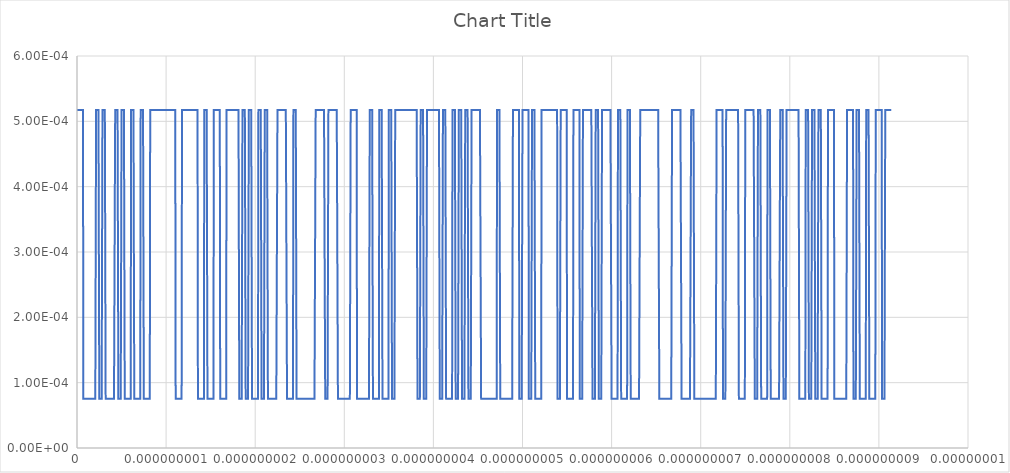
| Category | Series 0 |
|---|---|
| 0.0 | 0.001 |
| 2.23214285714285e-12 | 0.001 |
| 4.46428571428571e-12 | 0.001 |
| 6.69642857142857e-12 | 0.001 |
| 8.92857142857142e-12 | 0.001 |
| 1.11607142857142e-11 | 0.001 |
| 1.33928571428571e-11 | 0.001 |
| 1.5625e-11 | 0.001 |
| 1.78571428571428e-11 | 0.001 |
| 2.00892857142857e-11 | 0.001 |
| 2.23214285714285e-11 | 0.001 |
| 2.45535714285714e-11 | 0.001 |
| 2.67857142857142e-11 | 0.001 |
| 2.90178571428571e-11 | 0.001 |
| 3.125e-11 | 0.001 |
| 3.34821428571428e-11 | 0.001 |
| 3.57142857142857e-11 | 0.001 |
| 3.79464285714285e-11 | 0.001 |
| 4.01785714285714e-11 | 0.001 |
| 4.24107142857142e-11 | 0.001 |
| 4.46428571428571e-11 | 0.001 |
| 4.6875e-11 | 0.001 |
| 4.91071428571428e-11 | 0.001 |
| 5.13392857142857e-11 | 0.001 |
| 5.35714285714285e-11 | 0.001 |
| 5.58035714285714e-11 | 0.001 |
| 5.80357142857142e-11 | 0.001 |
| 6.02678571428571e-11 | 0.001 |
| 6.25e-11 | 0.001 |
| 6.47321428571428e-11 | 0.001 |
| 6.69642857142857e-11 | 0.001 |
| 6.91964285714285e-11 | 0.001 |
| 7.14285714285714e-11 | 0 |
| 7.36607142857142e-11 | 0 |
| 7.58928571428571e-11 | 0 |
| 7.8125e-11 | 0 |
| 8.03571428571428e-11 | 0 |
| 8.25892857142857e-11 | 0 |
| 8.48214285714285e-11 | 0 |
| 8.70535714285714e-11 | 0 |
| 8.92857142857142e-11 | 0 |
| 9.15178571428571e-11 | 0 |
| 9.37499999999999e-11 | 0 |
| 9.59821428571428e-11 | 0 |
| 9.82142857142857e-11 | 0 |
| 1.00446428571428e-10 | 0 |
| 1.02678571428571e-10 | 0 |
| 1.04910714285714e-10 | 0 |
| 1.07142857142857e-10 | 0 |
| 1.09375e-10 | 0 |
| 1.11607142857142e-10 | 0 |
| 1.13839285714285e-10 | 0 |
| 1.16071428571428e-10 | 0 |
| 1.18303571428571e-10 | 0 |
| 1.20535714285714e-10 | 0 |
| 1.22767857142857e-10 | 0 |
| 1.25e-10 | 0 |
| 1.27232142857142e-10 | 0 |
| 1.29464285714285e-10 | 0 |
| 1.31696428571428e-10 | 0 |
| 1.33928571428571e-10 | 0 |
| 1.36160714285714e-10 | 0 |
| 1.38392857142857e-10 | 0 |
| 1.40624999999999e-10 | 0 |
| 1.42857142857142e-10 | 0 |
| 1.45089285714285e-10 | 0 |
| 1.47321428571428e-10 | 0 |
| 1.49553571428571e-10 | 0 |
| 1.51785714285714e-10 | 0 |
| 1.54017857142857e-10 | 0 |
| 1.5625e-10 | 0 |
| 1.58482142857142e-10 | 0 |
| 1.60714285714285e-10 | 0 |
| 1.62946428571428e-10 | 0 |
| 1.65178571428571e-10 | 0 |
| 1.67410714285714e-10 | 0 |
| 1.69642857142857e-10 | 0 |
| 1.71874999999999e-10 | 0 |
| 1.74107142857142e-10 | 0 |
| 1.76339285714285e-10 | 0 |
| 1.78571428571428e-10 | 0 |
| 1.80803571428571e-10 | 0 |
| 1.83035714285714e-10 | 0 |
| 1.85267857142857e-10 | 0 |
| 1.875e-10 | 0 |
| 1.89732142857142e-10 | 0 |
| 1.91964285714285e-10 | 0 |
| 1.94196428571428e-10 | 0 |
| 1.96428571428571e-10 | 0 |
| 1.98660714285714e-10 | 0 |
| 2.00892857142857e-10 | 0 |
| 2.03125e-10 | 0 |
| 2.05357142857142e-10 | 0 |
| 2.07589285714285e-10 | 0 |
| 2.09821428571428e-10 | 0 |
| 2.12053571428571e-10 | 0 |
| 2.14285714285714e-10 | 0.001 |
| 2.16517857142857e-10 | 0.001 |
| 2.18749999999999e-10 | 0.001 |
| 2.20982142857142e-10 | 0.001 |
| 2.23214285714285e-10 | 0.001 |
| 2.25446428571428e-10 | 0.001 |
| 2.27678571428571e-10 | 0.001 |
| 2.29910714285714e-10 | 0.001 |
| 2.32142857142857e-10 | 0.001 |
| 2.34374999999999e-10 | 0.001 |
| 2.36607142857142e-10 | 0.001 |
| 2.38839285714285e-10 | 0.001 |
| 2.41071428571428e-10 | 0.001 |
| 2.43303571428571e-10 | 0.001 |
| 2.45535714285714e-10 | 0.001 |
| 2.47767857142857e-10 | 0.001 |
| 2.5e-10 | 0 |
| 2.52232142857142e-10 | 0 |
| 2.54464285714285e-10 | 0 |
| 2.56696428571428e-10 | 0 |
| 2.58928571428571e-10 | 0 |
| 2.61160714285714e-10 | 0 |
| 2.63392857142857e-10 | 0 |
| 2.65625e-10 | 0 |
| 2.67857142857142e-10 | 0 |
| 2.70089285714285e-10 | 0 |
| 2.72321428571428e-10 | 0 |
| 2.74553571428571e-10 | 0 |
| 2.76785714285714e-10 | 0 |
| 2.79017857142857e-10 | 0 |
| 2.81249999999999e-10 | 0 |
| 2.83482142857142e-10 | 0 |
| 2.85714285714285e-10 | 0.001 |
| 2.87946428571428e-10 | 0.001 |
| 2.90178571428571e-10 | 0.001 |
| 2.92410714285714e-10 | 0.001 |
| 2.94642857142857e-10 | 0.001 |
| 2.96874999999999e-10 | 0.001 |
| 2.99107142857142e-10 | 0.001 |
| 3.01339285714285e-10 | 0.001 |
| 3.03571428571428e-10 | 0.001 |
| 3.05803571428571e-10 | 0.001 |
| 3.08035714285714e-10 | 0.001 |
| 3.10267857142857e-10 | 0.001 |
| 3.125e-10 | 0.001 |
| 3.14732142857142e-10 | 0.001 |
| 3.16964285714285e-10 | 0.001 |
| 3.19196428571428e-10 | 0.001 |
| 3.21428571428571e-10 | 0 |
| 3.23660714285714e-10 | 0 |
| 3.25892857142857e-10 | 0 |
| 3.28124999999999e-10 | 0 |
| 3.30357142857142e-10 | 0 |
| 3.32589285714285e-10 | 0 |
| 3.34821428571428e-10 | 0 |
| 3.37053571428571e-10 | 0 |
| 3.39285714285714e-10 | 0 |
| 3.41517857142857e-10 | 0 |
| 3.43749999999999e-10 | 0 |
| 3.45982142857142e-10 | 0 |
| 3.48214285714285e-10 | 0 |
| 3.50446428571428e-10 | 0 |
| 3.52678571428571e-10 | 0 |
| 3.54910714285714e-10 | 0 |
| 3.57142857142857e-10 | 0 |
| 3.59375e-10 | 0 |
| 3.61607142857142e-10 | 0 |
| 3.63839285714285e-10 | 0 |
| 3.66071428571428e-10 | 0 |
| 3.68303571428571e-10 | 0 |
| 3.70535714285714e-10 | 0 |
| 3.72767857142857e-10 | 0 |
| 3.75e-10 | 0 |
| 3.77232142857142e-10 | 0 |
| 3.79464285714285e-10 | 0 |
| 3.81696428571428e-10 | 0 |
| 3.83928571428571e-10 | 0 |
| 3.86160714285714e-10 | 0 |
| 3.88392857142857e-10 | 0 |
| 3.90624999999999e-10 | 0 |
| 3.92857142857142e-10 | 0 |
| 3.95089285714285e-10 | 0 |
| 3.97321428571428e-10 | 0 |
| 3.99553571428571e-10 | 0 |
| 4.01785714285714e-10 | 0 |
| 4.04017857142857e-10 | 0 |
| 4.0625e-10 | 0 |
| 4.08482142857142e-10 | 0 |
| 4.10714285714285e-10 | 0 |
| 4.12946428571428e-10 | 0 |
| 4.15178571428571e-10 | 0 |
| 4.17410714285714e-10 | 0 |
| 4.19642857142857e-10 | 0 |
| 4.21875e-10 | 0 |
| 4.24107142857142e-10 | 0 |
| 4.26339285714285e-10 | 0 |
| 4.28571428571428e-10 | 0.001 |
| 4.30803571428571e-10 | 0.001 |
| 4.33035714285714e-10 | 0.001 |
| 4.35267857142857e-10 | 0.001 |
| 4.37499999999999e-10 | 0.001 |
| 4.39732142857142e-10 | 0.001 |
| 4.41964285714285e-10 | 0.001 |
| 4.44196428571428e-10 | 0.001 |
| 4.46428571428571e-10 | 0.001 |
| 4.48660714285714e-10 | 0.001 |
| 4.50892857142857e-10 | 0.001 |
| 4.53124999999999e-10 | 0.001 |
| 4.55357142857142e-10 | 0.001 |
| 4.57589285714285e-10 | 0.001 |
| 4.59821428571428e-10 | 0.001 |
| 4.62053571428571e-10 | 0.001 |
| 4.64285714285714e-10 | 0 |
| 4.66517857142857e-10 | 0 |
| 4.68749999999999e-10 | 0 |
| 4.70982142857142e-10 | 0 |
| 4.73214285714285e-10 | 0 |
| 4.75446428571428e-10 | 0 |
| 4.77678571428571e-10 | 0 |
| 4.79910714285714e-10 | 0 |
| 4.82142857142857e-10 | 0 |
| 4.84374999999999e-10 | 0 |
| 4.86607142857142e-10 | 0 |
| 4.88839285714285e-10 | 0 |
| 4.91071428571428e-10 | 0 |
| 4.93303571428571e-10 | 0 |
| 4.95535714285714e-10 | 0 |
| 4.97767857142857e-10 | 0 |
| 5e-10 | 0.001 |
| 5.02232142857142e-10 | 0.001 |
| 5.04464285714285e-10 | 0.001 |
| 5.06696428571428e-10 | 0.001 |
| 5.08928571428571e-10 | 0.001 |
| 5.11160714285714e-10 | 0.001 |
| 5.13392857142857e-10 | 0.001 |
| 5.15624999999999e-10 | 0.001 |
| 5.17857142857142e-10 | 0.001 |
| 5.20089285714285e-10 | 0.001 |
| 5.22321428571428e-10 | 0.001 |
| 5.24553571428571e-10 | 0.001 |
| 5.26785714285714e-10 | 0.001 |
| 5.29017857142857e-10 | 0.001 |
| 5.3125e-10 | 0.001 |
| 5.33482142857142e-10 | 0.001 |
| 5.35714285714285e-10 | 0 |
| 5.37946428571428e-10 | 0 |
| 5.40178571428571e-10 | 0 |
| 5.42410714285714e-10 | 0 |
| 5.44642857142857e-10 | 0 |
| 5.46875e-10 | 0 |
| 5.49107142857142e-10 | 0 |
| 5.51339285714285e-10 | 0 |
| 5.53571428571428e-10 | 0 |
| 5.55803571428571e-10 | 0 |
| 5.58035714285714e-10 | 0 |
| 5.60267857142857e-10 | 0 |
| 5.62499999999999e-10 | 0 |
| 5.64732142857142e-10 | 0 |
| 5.66964285714285e-10 | 0 |
| 5.69196428571428e-10 | 0 |
| 5.71428571428571e-10 | 0 |
| 5.73660714285714e-10 | 0 |
| 5.75892857142857e-10 | 0 |
| 5.78125e-10 | 0 |
| 5.80357142857142e-10 | 0 |
| 5.82589285714285e-10 | 0 |
| 5.84821428571428e-10 | 0 |
| 5.87053571428571e-10 | 0 |
| 5.89285714285714e-10 | 0 |
| 5.91517857142857e-10 | 0 |
| 5.93749999999999e-10 | 0 |
| 5.95982142857142e-10 | 0 |
| 5.98214285714285e-10 | 0 |
| 6.00446428571428e-10 | 0 |
| 6.02678571428571e-10 | 0 |
| 6.04910714285714e-10 | 0 |
| 6.07142857142857e-10 | 0.001 |
| 6.09374999999999e-10 | 0.001 |
| 6.11607142857142e-10 | 0.001 |
| 6.13839285714285e-10 | 0.001 |
| 6.16071428571428e-10 | 0.001 |
| 6.18303571428571e-10 | 0.001 |
| 6.20535714285714e-10 | 0.001 |
| 6.22767857142857e-10 | 0.001 |
| 6.25e-10 | 0.001 |
| 6.27232142857142e-10 | 0.001 |
| 6.29464285714285e-10 | 0.001 |
| 6.31696428571428e-10 | 0.001 |
| 6.33928571428571e-10 | 0.001 |
| 6.36160714285714e-10 | 0.001 |
| 6.38392857142857e-10 | 0.001 |
| 6.40624999999999e-10 | 0.001 |
| 6.42857142857142e-10 | 0 |
| 6.45089285714285e-10 | 0 |
| 6.47321428571428e-10 | 0 |
| 6.49553571428571e-10 | 0 |
| 6.51785714285714e-10 | 0 |
| 6.54017857142857e-10 | 0 |
| 6.56249999999999e-10 | 0 |
| 6.58482142857142e-10 | 0 |
| 6.60714285714285e-10 | 0 |
| 6.62946428571428e-10 | 0 |
| 6.65178571428571e-10 | 0 |
| 6.67410714285714e-10 | 0 |
| 6.69642857142857e-10 | 0 |
| 6.71875e-10 | 0 |
| 6.74107142857142e-10 | 0 |
| 6.76339285714285e-10 | 0 |
| 6.78571428571428e-10 | 0 |
| 6.80803571428571e-10 | 0 |
| 6.83035714285714e-10 | 0 |
| 6.85267857142857e-10 | 0 |
| 6.87499999999999e-10 | 0 |
| 6.89732142857142e-10 | 0 |
| 6.91964285714285e-10 | 0 |
| 6.94196428571428e-10 | 0 |
| 6.96428571428571e-10 | 0 |
| 6.98660714285714e-10 | 0 |
| 7.00892857142857e-10 | 0 |
| 7.03124999999999e-10 | 0 |
| 7.05357142857142e-10 | 0 |
| 7.07589285714285e-10 | 0 |
| 7.09821428571428e-10 | 0 |
| 7.12053571428571e-10 | 0 |
| 7.14285714285714e-10 | 0.001 |
| 7.16517857142857e-10 | 0.001 |
| 7.1875e-10 | 0.001 |
| 7.20982142857142e-10 | 0.001 |
| 7.23214285714285e-10 | 0.001 |
| 7.25446428571428e-10 | 0.001 |
| 7.27678571428571e-10 | 0.001 |
| 7.29910714285714e-10 | 0.001 |
| 7.32142857142857e-10 | 0.001 |
| 7.34374999999999e-10 | 0.001 |
| 7.36607142857142e-10 | 0.001 |
| 7.38839285714285e-10 | 0.001 |
| 7.41071428571428e-10 | 0.001 |
| 7.43303571428571e-10 | 0.001 |
| 7.45535714285714e-10 | 0.001 |
| 7.47767857142857e-10 | 0.001 |
| 7.5e-10 | 0 |
| 7.52232142857142e-10 | 0 |
| 7.54464285714285e-10 | 0 |
| 7.56696428571428e-10 | 0 |
| 7.58928571428571e-10 | 0 |
| 7.61160714285714e-10 | 0 |
| 7.63392857142857e-10 | 0 |
| 7.65625e-10 | 0 |
| 7.67857142857142e-10 | 0 |
| 7.70089285714285e-10 | 0 |
| 7.72321428571428e-10 | 0 |
| 7.74553571428571e-10 | 0 |
| 7.76785714285714e-10 | 0 |
| 7.79017857142857e-10 | 0 |
| 7.81249999999999e-10 | 0 |
| 7.83482142857142e-10 | 0 |
| 7.85714285714285e-10 | 0 |
| 7.87946428571428e-10 | 0 |
| 7.90178571428571e-10 | 0 |
| 7.92410714285714e-10 | 0 |
| 7.94642857142857e-10 | 0 |
| 7.96875e-10 | 0 |
| 7.99107142857142e-10 | 0 |
| 8.01339285714285e-10 | 0 |
| 8.03571428571428e-10 | 0 |
| 8.05803571428571e-10 | 0 |
| 8.08035714285714e-10 | 0 |
| 8.10267857142857e-10 | 0 |
| 8.125e-10 | 0 |
| 8.14732142857142e-10 | 0 |
| 8.16964285714285e-10 | 0 |
| 8.19196428571428e-10 | 0 |
| 8.21428571428571e-10 | 0.001 |
| 8.23660714285714e-10 | 0.001 |
| 8.25892857142857e-10 | 0.001 |
| 8.28124999999999e-10 | 0.001 |
| 8.30357142857142e-10 | 0.001 |
| 8.32589285714285e-10 | 0.001 |
| 8.34821428571428e-10 | 0.001 |
| 8.37053571428571e-10 | 0.001 |
| 8.39285714285714e-10 | 0.001 |
| 8.41517857142857e-10 | 0.001 |
| 8.4375e-10 | 0.001 |
| 8.45982142857142e-10 | 0.001 |
| 8.48214285714285e-10 | 0.001 |
| 8.50446428571428e-10 | 0.001 |
| 8.52678571428571e-10 | 0.001 |
| 8.54910714285714e-10 | 0.001 |
| 8.57142857142857e-10 | 0.001 |
| 8.59374999999999e-10 | 0.001 |
| 8.61607142857142e-10 | 0.001 |
| 8.63839285714285e-10 | 0.001 |
| 8.66071428571428e-10 | 0.001 |
| 8.68303571428571e-10 | 0.001 |
| 8.70535714285714e-10 | 0.001 |
| 8.72767857142857e-10 | 0.001 |
| 8.74999999999999e-10 | 0.001 |
| 8.77232142857142e-10 | 0.001 |
| 8.79464285714285e-10 | 0.001 |
| 8.81696428571428e-10 | 0.001 |
| 8.83928571428571e-10 | 0.001 |
| 8.86160714285714e-10 | 0.001 |
| 8.88392857142857e-10 | 0.001 |
| 8.90625e-10 | 0.001 |
| 8.92857142857142e-10 | 0.001 |
| 8.95089285714285e-10 | 0.001 |
| 8.97321428571428e-10 | 0.001 |
| 8.99553571428571e-10 | 0.001 |
| 9.01785714285714e-10 | 0.001 |
| 9.04017857142857e-10 | 0.001 |
| 9.06249999999999e-10 | 0.001 |
| 9.08482142857142e-10 | 0.001 |
| 9.10714285714285e-10 | 0.001 |
| 9.12946428571428e-10 | 0.001 |
| 9.15178571428571e-10 | 0.001 |
| 9.17410714285714e-10 | 0.001 |
| 9.19642857142857e-10 | 0.001 |
| 9.21874999999999e-10 | 0.001 |
| 9.24107142857142e-10 | 0.001 |
| 9.26339285714285e-10 | 0.001 |
| 9.28571428571428e-10 | 0.001 |
| 9.30803571428571e-10 | 0.001 |
| 9.33035714285714e-10 | 0.001 |
| 9.35267857142857e-10 | 0.001 |
| 9.37499999999999e-10 | 0.001 |
| 9.39732142857142e-10 | 0.001 |
| 9.41964285714285e-10 | 0.001 |
| 9.44196428571428e-10 | 0.001 |
| 9.46428571428571e-10 | 0.001 |
| 9.48660714285714e-10 | 0.001 |
| 9.50892857142857e-10 | 0.001 |
| 9.53125e-10 | 0.001 |
| 9.55357142857142e-10 | 0.001 |
| 9.57589285714285e-10 | 0.001 |
| 9.59821428571428e-10 | 0.001 |
| 9.62053571428571e-10 | 0.001 |
| 9.64285714285714e-10 | 0.001 |
| 9.66517857142857e-10 | 0.001 |
| 9.68749999999999e-10 | 0.001 |
| 9.70982142857142e-10 | 0.001 |
| 9.73214285714285e-10 | 0.001 |
| 9.75446428571428e-10 | 0.001 |
| 9.77678571428571e-10 | 0.001 |
| 9.79910714285714e-10 | 0.001 |
| 9.82142857142857e-10 | 0.001 |
| 9.84374999999999e-10 | 0.001 |
| 9.86607142857142e-10 | 0.001 |
| 9.88839285714285e-10 | 0.001 |
| 9.91071428571428e-10 | 0.001 |
| 9.93303571428571e-10 | 0.001 |
| 9.95535714285714e-10 | 0.001 |
| 9.97767857142857e-10 | 0.001 |
| 1e-09 | 0.001 |
| 1.00223214285714e-09 | 0.001 |
| 1.00446428571428e-09 | 0.001 |
| 1.00669642857142e-09 | 0.001 |
| 1.00892857142857e-09 | 0.001 |
| 1.01116071428571e-09 | 0.001 |
| 1.01339285714285e-09 | 0.001 |
| 1.015625e-09 | 0.001 |
| 1.01785714285714e-09 | 0.001 |
| 1.02008928571428e-09 | 0.001 |
| 1.02232142857142e-09 | 0.001 |
| 1.02455357142857e-09 | 0.001 |
| 1.02678571428571e-09 | 0.001 |
| 1.02901785714285e-09 | 0.001 |
| 1.03124999999999e-09 | 0.001 |
| 1.03348214285714e-09 | 0.001 |
| 1.03571428571428e-09 | 0.001 |
| 1.03794642857142e-09 | 0.001 |
| 1.04017857142857e-09 | 0.001 |
| 1.04241071428571e-09 | 0.001 |
| 1.04464285714285e-09 | 0.001 |
| 1.046875e-09 | 0.001 |
| 1.04910714285714e-09 | 0.001 |
| 1.05133928571428e-09 | 0.001 |
| 1.05357142857142e-09 | 0.001 |
| 1.05580357142857e-09 | 0.001 |
| 1.05803571428571e-09 | 0.001 |
| 1.06026785714285e-09 | 0.001 |
| 1.0625e-09 | 0.001 |
| 1.06473214285714e-09 | 0.001 |
| 1.06696428571428e-09 | 0.001 |
| 1.06919642857142e-09 | 0.001 |
| 1.07142857142857e-09 | 0.001 |
| 1.07366071428571e-09 | 0.001 |
| 1.07589285714285e-09 | 0.001 |
| 1.07812499999999e-09 | 0.001 |
| 1.08035714285714e-09 | 0.001 |
| 1.08258928571428e-09 | 0.001 |
| 1.08482142857142e-09 | 0.001 |
| 1.08705357142857e-09 | 0.001 |
| 1.08928571428571e-09 | 0.001 |
| 1.09151785714285e-09 | 0.001 |
| 1.09375e-09 | 0.001 |
| 1.09598214285714e-09 | 0.001 |
| 1.09821428571428e-09 | 0.001 |
| 1.10044642857142e-09 | 0.001 |
| 1.10267857142857e-09 | 0.001 |
| 1.10491071428571e-09 | 0.001 |
| 1.10714285714285e-09 | 0 |
| 1.109375e-09 | 0 |
| 1.11160714285714e-09 | 0 |
| 1.11383928571428e-09 | 0 |
| 1.11607142857142e-09 | 0 |
| 1.11830357142857e-09 | 0 |
| 1.12053571428571e-09 | 0 |
| 1.12276785714285e-09 | 0 |
| 1.12499999999999e-09 | 0 |
| 1.12723214285714e-09 | 0 |
| 1.12946428571428e-09 | 0 |
| 1.13169642857142e-09 | 0 |
| 1.13392857142857e-09 | 0 |
| 1.13616071428571e-09 | 0 |
| 1.13839285714285e-09 | 0 |
| 1.140625e-09 | 0 |
| 1.14285714285714e-09 | 0 |
| 1.14508928571428e-09 | 0 |
| 1.14732142857142e-09 | 0 |
| 1.14955357142857e-09 | 0 |
| 1.15178571428571e-09 | 0 |
| 1.15401785714285e-09 | 0 |
| 1.15625e-09 | 0 |
| 1.15848214285714e-09 | 0 |
| 1.16071428571428e-09 | 0 |
| 1.16294642857142e-09 | 0 |
| 1.16517857142857e-09 | 0 |
| 1.16741071428571e-09 | 0 |
| 1.16964285714285e-09 | 0 |
| 1.17187499999999e-09 | 0 |
| 1.17410714285714e-09 | 0 |
| 1.17633928571428e-09 | 0 |
| 1.17857142857142e-09 | 0.001 |
| 1.18080357142857e-09 | 0.001 |
| 1.18303571428571e-09 | 0.001 |
| 1.18526785714285e-09 | 0.001 |
| 1.18749999999999e-09 | 0.001 |
| 1.18973214285714e-09 | 0.001 |
| 1.19196428571428e-09 | 0.001 |
| 1.19419642857142e-09 | 0.001 |
| 1.19642857142857e-09 | 0.001 |
| 1.19866071428571e-09 | 0.001 |
| 1.20089285714285e-09 | 0.001 |
| 1.203125e-09 | 0.001 |
| 1.20535714285714e-09 | 0.001 |
| 1.20758928571428e-09 | 0.001 |
| 1.20982142857142e-09 | 0.001 |
| 1.21205357142857e-09 | 0.001 |
| 1.21428571428571e-09 | 0.001 |
| 1.21651785714285e-09 | 0.001 |
| 1.21875e-09 | 0.001 |
| 1.22098214285714e-09 | 0.001 |
| 1.22321428571428e-09 | 0.001 |
| 1.22544642857142e-09 | 0.001 |
| 1.22767857142857e-09 | 0.001 |
| 1.22991071428571e-09 | 0.001 |
| 1.23214285714285e-09 | 0.001 |
| 1.23437499999999e-09 | 0.001 |
| 1.23660714285714e-09 | 0.001 |
| 1.23883928571428e-09 | 0.001 |
| 1.24107142857142e-09 | 0.001 |
| 1.24330357142857e-09 | 0.001 |
| 1.24553571428571e-09 | 0.001 |
| 1.24776785714285e-09 | 0.001 |
| 1.25e-09 | 0.001 |
| 1.25223214285714e-09 | 0.001 |
| 1.25446428571428e-09 | 0.001 |
| 1.25669642857142e-09 | 0.001 |
| 1.25892857142857e-09 | 0.001 |
| 1.26116071428571e-09 | 0.001 |
| 1.26339285714285e-09 | 0.001 |
| 1.265625e-09 | 0.001 |
| 1.26785714285714e-09 | 0.001 |
| 1.27008928571428e-09 | 0.001 |
| 1.27232142857142e-09 | 0.001 |
| 1.27455357142857e-09 | 0.001 |
| 1.27678571428571e-09 | 0.001 |
| 1.27901785714285e-09 | 0.001 |
| 1.28124999999999e-09 | 0.001 |
| 1.28348214285714e-09 | 0.001 |
| 1.28571428571428e-09 | 0.001 |
| 1.28794642857142e-09 | 0.001 |
| 1.29017857142857e-09 | 0.001 |
| 1.29241071428571e-09 | 0.001 |
| 1.29464285714285e-09 | 0.001 |
| 1.296875e-09 | 0.001 |
| 1.29910714285714e-09 | 0.001 |
| 1.30133928571428e-09 | 0.001 |
| 1.30357142857142e-09 | 0.001 |
| 1.30580357142857e-09 | 0.001 |
| 1.30803571428571e-09 | 0.001 |
| 1.31026785714285e-09 | 0.001 |
| 1.3125e-09 | 0.001 |
| 1.31473214285714e-09 | 0.001 |
| 1.31696428571428e-09 | 0.001 |
| 1.31919642857142e-09 | 0.001 |
| 1.32142857142857e-09 | 0.001 |
| 1.32366071428571e-09 | 0.001 |
| 1.32589285714285e-09 | 0.001 |
| 1.32812499999999e-09 | 0.001 |
| 1.33035714285714e-09 | 0.001 |
| 1.33258928571428e-09 | 0.001 |
| 1.33482142857142e-09 | 0.001 |
| 1.33705357142857e-09 | 0.001 |
| 1.33928571428571e-09 | 0.001 |
| 1.34151785714285e-09 | 0.001 |
| 1.34375e-09 | 0.001 |
| 1.34598214285714e-09 | 0.001 |
| 1.34821428571428e-09 | 0.001 |
| 1.35044642857142e-09 | 0.001 |
| 1.35267857142857e-09 | 0.001 |
| 1.35491071428571e-09 | 0.001 |
| 1.35714285714285e-09 | 0 |
| 1.359375e-09 | 0 |
| 1.36160714285714e-09 | 0 |
| 1.36383928571428e-09 | 0 |
| 1.36607142857142e-09 | 0 |
| 1.36830357142857e-09 | 0 |
| 1.37053571428571e-09 | 0 |
| 1.37276785714285e-09 | 0 |
| 1.37499999999999e-09 | 0 |
| 1.37723214285714e-09 | 0 |
| 1.37946428571428e-09 | 0 |
| 1.38169642857142e-09 | 0 |
| 1.38392857142857e-09 | 0 |
| 1.38616071428571e-09 | 0 |
| 1.38839285714285e-09 | 0 |
| 1.390625e-09 | 0 |
| 1.39285714285714e-09 | 0 |
| 1.39508928571428e-09 | 0 |
| 1.39732142857142e-09 | 0 |
| 1.39955357142857e-09 | 0 |
| 1.40178571428571e-09 | 0 |
| 1.40401785714285e-09 | 0 |
| 1.40625e-09 | 0 |
| 1.40848214285714e-09 | 0 |
| 1.41071428571428e-09 | 0 |
| 1.41294642857142e-09 | 0 |
| 1.41517857142857e-09 | 0 |
| 1.41741071428571e-09 | 0 |
| 1.41964285714285e-09 | 0 |
| 1.42187499999999e-09 | 0 |
| 1.42410714285714e-09 | 0 |
| 1.42633928571428e-09 | 0 |
| 1.42857142857142e-09 | 0.001 |
| 1.43080357142857e-09 | 0.001 |
| 1.43303571428571e-09 | 0.001 |
| 1.43526785714285e-09 | 0.001 |
| 1.4375e-09 | 0.001 |
| 1.43973214285714e-09 | 0.001 |
| 1.44196428571428e-09 | 0.001 |
| 1.44419642857142e-09 | 0.001 |
| 1.44642857142857e-09 | 0.001 |
| 1.44866071428571e-09 | 0.001 |
| 1.45089285714285e-09 | 0.001 |
| 1.453125e-09 | 0.001 |
| 1.45535714285714e-09 | 0.001 |
| 1.45758928571428e-09 | 0.001 |
| 1.45982142857142e-09 | 0.001 |
| 1.46205357142857e-09 | 0.001 |
| 1.46428571428571e-09 | 0 |
| 1.46651785714285e-09 | 0 |
| 1.46874999999999e-09 | 0 |
| 1.47098214285714e-09 | 0 |
| 1.47321428571428e-09 | 0 |
| 1.47544642857142e-09 | 0 |
| 1.47767857142857e-09 | 0 |
| 1.47991071428571e-09 | 0 |
| 1.48214285714285e-09 | 0 |
| 1.484375e-09 | 0 |
| 1.48660714285714e-09 | 0 |
| 1.48883928571428e-09 | 0 |
| 1.49107142857142e-09 | 0 |
| 1.49330357142857e-09 | 0 |
| 1.49553571428571e-09 | 0 |
| 1.49776785714285e-09 | 0 |
| 1.5e-09 | 0 |
| 1.50223214285714e-09 | 0 |
| 1.50446428571428e-09 | 0 |
| 1.50669642857142e-09 | 0 |
| 1.50892857142857e-09 | 0 |
| 1.51116071428571e-09 | 0 |
| 1.51339285714285e-09 | 0 |
| 1.51562499999999e-09 | 0 |
| 1.51785714285714e-09 | 0 |
| 1.52008928571428e-09 | 0 |
| 1.52232142857142e-09 | 0 |
| 1.52455357142857e-09 | 0 |
| 1.52678571428571e-09 | 0 |
| 1.52901785714285e-09 | 0 |
| 1.53125e-09 | 0 |
| 1.53348214285714e-09 | 0 |
| 1.53571428571428e-09 | 0.001 |
| 1.53794642857142e-09 | 0.001 |
| 1.54017857142857e-09 | 0.001 |
| 1.54241071428571e-09 | 0.001 |
| 1.54464285714285e-09 | 0.001 |
| 1.546875e-09 | 0.001 |
| 1.54910714285714e-09 | 0.001 |
| 1.55133928571428e-09 | 0.001 |
| 1.55357142857142e-09 | 0.001 |
| 1.55580357142857e-09 | 0.001 |
| 1.55803571428571e-09 | 0.001 |
| 1.56026785714285e-09 | 0.001 |
| 1.56249999999999e-09 | 0.001 |
| 1.56473214285714e-09 | 0.001 |
| 1.56696428571428e-09 | 0.001 |
| 1.56919642857142e-09 | 0.001 |
| 1.57142857142857e-09 | 0.001 |
| 1.57366071428571e-09 | 0.001 |
| 1.57589285714285e-09 | 0.001 |
| 1.578125e-09 | 0.001 |
| 1.58035714285714e-09 | 0.001 |
| 1.58258928571428e-09 | 0.001 |
| 1.58482142857142e-09 | 0.001 |
| 1.58705357142857e-09 | 0.001 |
| 1.58928571428571e-09 | 0.001 |
| 1.59151785714285e-09 | 0.001 |
| 1.59375e-09 | 0.001 |
| 1.59598214285714e-09 | 0.001 |
| 1.59821428571428e-09 | 0.001 |
| 1.60044642857142e-09 | 0.001 |
| 1.60267857142857e-09 | 0.001 |
| 1.60491071428571e-09 | 0.001 |
| 1.60714285714285e-09 | 0 |
| 1.60937499999999e-09 | 0 |
| 1.61160714285714e-09 | 0 |
| 1.61383928571428e-09 | 0 |
| 1.61607142857142e-09 | 0 |
| 1.61830357142857e-09 | 0 |
| 1.62053571428571e-09 | 0 |
| 1.62276785714285e-09 | 0 |
| 1.625e-09 | 0 |
| 1.62723214285714e-09 | 0 |
| 1.62946428571428e-09 | 0 |
| 1.63169642857142e-09 | 0 |
| 1.63392857142857e-09 | 0 |
| 1.63616071428571e-09 | 0 |
| 1.63839285714285e-09 | 0 |
| 1.640625e-09 | 0 |
| 1.64285714285714e-09 | 0 |
| 1.64508928571428e-09 | 0 |
| 1.64732142857142e-09 | 0 |
| 1.64955357142857e-09 | 0 |
| 1.65178571428571e-09 | 0 |
| 1.65401785714285e-09 | 0 |
| 1.65624999999999e-09 | 0 |
| 1.65848214285714e-09 | 0 |
| 1.66071428571428e-09 | 0 |
| 1.66294642857142e-09 | 0 |
| 1.66517857142857e-09 | 0 |
| 1.66741071428571e-09 | 0 |
| 1.66964285714285e-09 | 0 |
| 1.67187499999999e-09 | 0 |
| 1.67410714285714e-09 | 0 |
| 1.67633928571428e-09 | 0 |
| 1.67857142857142e-09 | 0.001 |
| 1.68080357142857e-09 | 0.001 |
| 1.68303571428571e-09 | 0.001 |
| 1.68526785714285e-09 | 0.001 |
| 1.6875e-09 | 0.001 |
| 1.68973214285714e-09 | 0.001 |
| 1.69196428571428e-09 | 0.001 |
| 1.69419642857142e-09 | 0.001 |
| 1.69642857142857e-09 | 0.001 |
| 1.69866071428571e-09 | 0.001 |
| 1.70089285714285e-09 | 0.001 |
| 1.70312499999999e-09 | 0.001 |
| 1.70535714285714e-09 | 0.001 |
| 1.70758928571428e-09 | 0.001 |
| 1.70982142857142e-09 | 0.001 |
| 1.71205357142857e-09 | 0.001 |
| 1.71428571428571e-09 | 0.001 |
| 1.71651785714285e-09 | 0.001 |
| 1.71874999999999e-09 | 0.001 |
| 1.72098214285714e-09 | 0.001 |
| 1.72321428571428e-09 | 0.001 |
| 1.72544642857142e-09 | 0.001 |
| 1.72767857142857e-09 | 0.001 |
| 1.72991071428571e-09 | 0.001 |
| 1.73214285714285e-09 | 0.001 |
| 1.734375e-09 | 0.001 |
| 1.73660714285714e-09 | 0.001 |
| 1.73883928571428e-09 | 0.001 |
| 1.74107142857142e-09 | 0.001 |
| 1.74330357142857e-09 | 0.001 |
| 1.74553571428571e-09 | 0.001 |
| 1.74776785714285e-09 | 0.001 |
| 1.75e-09 | 0.001 |
| 1.75223214285714e-09 | 0.001 |
| 1.75446428571428e-09 | 0.001 |
| 1.75669642857142e-09 | 0.001 |
| 1.75892857142857e-09 | 0.001 |
| 1.76116071428571e-09 | 0.001 |
| 1.76339285714285e-09 | 0.001 |
| 1.76562499999999e-09 | 0.001 |
| 1.76785714285714e-09 | 0.001 |
| 1.77008928571428e-09 | 0.001 |
| 1.77232142857142e-09 | 0.001 |
| 1.77455357142857e-09 | 0.001 |
| 1.77678571428571e-09 | 0.001 |
| 1.77901785714285e-09 | 0.001 |
| 1.78125e-09 | 0.001 |
| 1.78348214285714e-09 | 0.001 |
| 1.78571428571428e-09 | 0.001 |
| 1.78794642857142e-09 | 0.001 |
| 1.79017857142857e-09 | 0.001 |
| 1.79241071428571e-09 | 0.001 |
| 1.79464285714285e-09 | 0.001 |
| 1.796875e-09 | 0.001 |
| 1.79910714285714e-09 | 0.001 |
| 1.80133928571428e-09 | 0.001 |
| 1.80357142857142e-09 | 0.001 |
| 1.80580357142857e-09 | 0.001 |
| 1.80803571428571e-09 | 0.001 |
| 1.81026785714285e-09 | 0.001 |
| 1.81249999999999e-09 | 0.001 |
| 1.81473214285714e-09 | 0.001 |
| 1.81696428571428e-09 | 0.001 |
| 1.81919642857142e-09 | 0.001 |
| 1.82142857142857e-09 | 0 |
| 1.82366071428571e-09 | 0 |
| 1.82589285714285e-09 | 0 |
| 1.828125e-09 | 0 |
| 1.83035714285714e-09 | 0 |
| 1.83258928571428e-09 | 0 |
| 1.83482142857142e-09 | 0 |
| 1.83705357142857e-09 | 0 |
| 1.83928571428571e-09 | 0 |
| 1.84151785714285e-09 | 0 |
| 1.84375e-09 | 0 |
| 1.84598214285714e-09 | 0 |
| 1.84821428571428e-09 | 0 |
| 1.85044642857142e-09 | 0 |
| 1.85267857142857e-09 | 0 |
| 1.85491071428571e-09 | 0 |
| 1.85714285714285e-09 | 0.001 |
| 1.85937499999999e-09 | 0.001 |
| 1.86160714285714e-09 | 0.001 |
| 1.86383928571428e-09 | 0.001 |
| 1.86607142857142e-09 | 0.001 |
| 1.86830357142857e-09 | 0.001 |
| 1.87053571428571e-09 | 0.001 |
| 1.87276785714285e-09 | 0.001 |
| 1.87499999999999e-09 | 0.001 |
| 1.87723214285714e-09 | 0.001 |
| 1.87946428571428e-09 | 0.001 |
| 1.88169642857142e-09 | 0.001 |
| 1.88392857142857e-09 | 0.001 |
| 1.88616071428571e-09 | 0.001 |
| 1.88839285714285e-09 | 0.001 |
| 1.89062499999999e-09 | 0.001 |
| 1.89285714285714e-09 | 0 |
| 1.89508928571428e-09 | 0 |
| 1.89732142857142e-09 | 0 |
| 1.89955357142857e-09 | 0 |
| 1.90178571428571e-09 | 0 |
| 1.90401785714285e-09 | 0 |
| 1.90625e-09 | 0 |
| 1.90848214285714e-09 | 0 |
| 1.91071428571428e-09 | 0 |
| 1.91294642857142e-09 | 0 |
| 1.91517857142857e-09 | 0 |
| 1.91741071428571e-09 | 0 |
| 1.91964285714285e-09 | 0 |
| 1.921875e-09 | 0 |
| 1.92410714285714e-09 | 0 |
| 1.92633928571428e-09 | 0 |
| 1.92857142857142e-09 | 0.001 |
| 1.93080357142857e-09 | 0.001 |
| 1.93303571428571e-09 | 0.001 |
| 1.93526785714285e-09 | 0.001 |
| 1.9375e-09 | 0.001 |
| 1.93973214285714e-09 | 0.001 |
| 1.94196428571428e-09 | 0.001 |
| 1.94419642857142e-09 | 0.001 |
| 1.94642857142857e-09 | 0.001 |
| 1.94866071428571e-09 | 0.001 |
| 1.95089285714285e-09 | 0.001 |
| 1.95312499999999e-09 | 0.001 |
| 1.95535714285714e-09 | 0.001 |
| 1.95758928571428e-09 | 0.001 |
| 1.95982142857142e-09 | 0.001 |
| 1.96205357142857e-09 | 0.001 |
| 1.96428571428571e-09 | 0 |
| 1.96651785714285e-09 | 0 |
| 1.96874999999999e-09 | 0 |
| 1.97098214285714e-09 | 0 |
| 1.97321428571428e-09 | 0 |
| 1.97544642857142e-09 | 0 |
| 1.97767857142857e-09 | 0 |
| 1.97991071428571e-09 | 0 |
| 1.98214285714285e-09 | 0 |
| 1.98437499999999e-09 | 0 |
| 1.98660714285714e-09 | 0 |
| 1.98883928571428e-09 | 0 |
| 1.99107142857142e-09 | 0 |
| 1.99330357142857e-09 | 0 |
| 1.99553571428571e-09 | 0 |
| 1.99776785714285e-09 | 0 |
| 2e-09 | 0 |
| 2.00223214285714e-09 | 0 |
| 2.00446428571428e-09 | 0 |
| 2.00669642857142e-09 | 0 |
| 2.00892857142857e-09 | 0 |
| 2.01116071428571e-09 | 0 |
| 2.01339285714285e-09 | 0 |
| 2.015625e-09 | 0 |
| 2.01785714285714e-09 | 0 |
| 2.02008928571428e-09 | 0 |
| 2.02232142857142e-09 | 0 |
| 2.02455357142857e-09 | 0 |
| 2.02678571428571e-09 | 0 |
| 2.02901785714285e-09 | 0 |
| 2.03125e-09 | 0 |
| 2.03348214285714e-09 | 0 |
| 2.03571428571428e-09 | 0.001 |
| 2.03794642857142e-09 | 0.001 |
| 2.04017857142857e-09 | 0.001 |
| 2.04241071428571e-09 | 0.001 |
| 2.04464285714285e-09 | 0.001 |
| 2.04687499999999e-09 | 0.001 |
| 2.04910714285714e-09 | 0.001 |
| 2.05133928571428e-09 | 0.001 |
| 2.05357142857142e-09 | 0.001 |
| 2.05580357142857e-09 | 0.001 |
| 2.05803571428571e-09 | 0.001 |
| 2.06026785714285e-09 | 0.001 |
| 2.06249999999999e-09 | 0.001 |
| 2.06473214285714e-09 | 0.001 |
| 2.06696428571428e-09 | 0.001 |
| 2.06919642857142e-09 | 0.001 |
| 2.07142857142857e-09 | 0 |
| 2.07366071428571e-09 | 0 |
| 2.07589285714285e-09 | 0 |
| 2.07812499999999e-09 | 0 |
| 2.08035714285714e-09 | 0 |
| 2.08258928571428e-09 | 0 |
| 2.08482142857142e-09 | 0 |
| 2.08705357142857e-09 | 0 |
| 2.08928571428571e-09 | 0 |
| 2.09151785714285e-09 | 0 |
| 2.09375e-09 | 0 |
| 2.09598214285714e-09 | 0 |
| 2.09821428571428e-09 | 0 |
| 2.10044642857142e-09 | 0 |
| 2.10267857142857e-09 | 0 |
| 2.10491071428571e-09 | 0 |
| 2.10714285714285e-09 | 0.001 |
| 2.109375e-09 | 0.001 |
| 2.11160714285714e-09 | 0.001 |
| 2.11383928571428e-09 | 0.001 |
| 2.11607142857142e-09 | 0.001 |
| 2.11830357142857e-09 | 0.001 |
| 2.12053571428571e-09 | 0.001 |
| 2.12276785714285e-09 | 0.001 |
| 2.125e-09 | 0.001 |
| 2.12723214285714e-09 | 0.001 |
| 2.12946428571428e-09 | 0.001 |
| 2.13169642857142e-09 | 0.001 |
| 2.13392857142857e-09 | 0.001 |
| 2.13616071428571e-09 | 0.001 |
| 2.13839285714285e-09 | 0.001 |
| 2.14062499999999e-09 | 0.001 |
| 2.14285714285714e-09 | 0 |
| 2.14508928571428e-09 | 0 |
| 2.14732142857142e-09 | 0 |
| 2.14955357142857e-09 | 0 |
| 2.15178571428571e-09 | 0 |
| 2.15401785714285e-09 | 0 |
| 2.15624999999999e-09 | 0 |
| 2.15848214285714e-09 | 0 |
| 2.16071428571428e-09 | 0 |
| 2.16294642857142e-09 | 0 |
| 2.16517857142857e-09 | 0 |
| 2.16741071428571e-09 | 0 |
| 2.16964285714285e-09 | 0 |
| 2.17187499999999e-09 | 0 |
| 2.17410714285714e-09 | 0 |
| 2.17633928571428e-09 | 0 |
| 2.17857142857142e-09 | 0 |
| 2.18080357142857e-09 | 0 |
| 2.18303571428571e-09 | 0 |
| 2.18526785714285e-09 | 0 |
| 2.1875e-09 | 0 |
| 2.18973214285714e-09 | 0 |
| 2.19196428571428e-09 | 0 |
| 2.19419642857142e-09 | 0 |
| 2.19642857142857e-09 | 0 |
| 2.19866071428571e-09 | 0 |
| 2.20089285714285e-09 | 0 |
| 2.203125e-09 | 0 |
| 2.20535714285714e-09 | 0 |
| 2.20758928571428e-09 | 0 |
| 2.20982142857142e-09 | 0 |
| 2.21205357142857e-09 | 0 |
| 2.21428571428571e-09 | 0 |
| 2.21651785714285e-09 | 0 |
| 2.21875e-09 | 0 |
| 2.22098214285714e-09 | 0 |
| 2.22321428571428e-09 | 0 |
| 2.22544642857142e-09 | 0 |
| 2.22767857142857e-09 | 0 |
| 2.22991071428571e-09 | 0 |
| 2.23214285714285e-09 | 0 |
| 2.23437499999999e-09 | 0 |
| 2.23660714285714e-09 | 0 |
| 2.23883928571428e-09 | 0 |
| 2.24107142857142e-09 | 0 |
| 2.24330357142857e-09 | 0 |
| 2.24553571428571e-09 | 0 |
| 2.24776785714285e-09 | 0 |
| 2.24999999999999e-09 | 0.001 |
| 2.25223214285714e-09 | 0.001 |
| 2.25446428571428e-09 | 0.001 |
| 2.25669642857142e-09 | 0.001 |
| 2.25892857142857e-09 | 0.001 |
| 2.26116071428571e-09 | 0.001 |
| 2.26339285714285e-09 | 0.001 |
| 2.26562499999999e-09 | 0.001 |
| 2.26785714285714e-09 | 0.001 |
| 2.27008928571428e-09 | 0.001 |
| 2.27232142857142e-09 | 0.001 |
| 2.27455357142857e-09 | 0.001 |
| 2.27678571428571e-09 | 0.001 |
| 2.27901785714285e-09 | 0.001 |
| 2.28125e-09 | 0.001 |
| 2.28348214285714e-09 | 0.001 |
| 2.28571428571428e-09 | 0.001 |
| 2.28794642857142e-09 | 0.001 |
| 2.29017857142857e-09 | 0.001 |
| 2.29241071428571e-09 | 0.001 |
| 2.29464285714285e-09 | 0.001 |
| 2.296875e-09 | 0.001 |
| 2.29910714285714e-09 | 0.001 |
| 2.30133928571428e-09 | 0.001 |
| 2.30357142857142e-09 | 0.001 |
| 2.30580357142857e-09 | 0.001 |
| 2.30803571428571e-09 | 0.001 |
| 2.31026785714285e-09 | 0.001 |
| 2.3125e-09 | 0.001 |
| 2.31473214285714e-09 | 0.001 |
| 2.31696428571428e-09 | 0.001 |
| 2.31919642857142e-09 | 0.001 |
| 2.32142857142857e-09 | 0.001 |
| 2.32366071428571e-09 | 0.001 |
| 2.32589285714285e-09 | 0.001 |
| 2.328125e-09 | 0.001 |
| 2.33035714285714e-09 | 0.001 |
| 2.33258928571428e-09 | 0.001 |
| 2.33482142857142e-09 | 0.001 |
| 2.33705357142857e-09 | 0.001 |
| 2.33928571428571e-09 | 0.001 |
| 2.34151785714285e-09 | 0.001 |
| 2.34374999999999e-09 | 0.001 |
| 2.34598214285714e-09 | 0.001 |
| 2.34821428571428e-09 | 0.001 |
| 2.35044642857142e-09 | 0.001 |
| 2.35267857142857e-09 | 0.001 |
| 2.35491071428571e-09 | 0.001 |
| 2.35714285714285e-09 | 0 |
| 2.35937499999999e-09 | 0 |
| 2.36160714285714e-09 | 0 |
| 2.36383928571428e-09 | 0 |
| 2.36607142857142e-09 | 0 |
| 2.36830357142857e-09 | 0 |
| 2.37053571428571e-09 | 0 |
| 2.37276785714285e-09 | 0 |
| 2.37499999999999e-09 | 0 |
| 2.37723214285714e-09 | 0 |
| 2.37946428571428e-09 | 0 |
| 2.38169642857142e-09 | 0 |
| 2.38392857142857e-09 | 0 |
| 2.38616071428571e-09 | 0 |
| 2.38839285714285e-09 | 0 |
| 2.390625e-09 | 0 |
| 2.39285714285714e-09 | 0 |
| 2.39508928571428e-09 | 0 |
| 2.39732142857142e-09 | 0 |
| 2.39955357142857e-09 | 0 |
| 2.40178571428571e-09 | 0 |
| 2.40401785714285e-09 | 0 |
| 2.40625e-09 | 0 |
| 2.40848214285714e-09 | 0 |
| 2.41071428571428e-09 | 0 |
| 2.41294642857142e-09 | 0 |
| 2.41517857142857e-09 | 0 |
| 2.41741071428571e-09 | 0 |
| 2.41964285714285e-09 | 0 |
| 2.421875e-09 | 0 |
| 2.42410714285714e-09 | 0 |
| 2.42633928571428e-09 | 0 |
| 2.42857142857142e-09 | 0.001 |
| 2.43080357142857e-09 | 0.001 |
| 2.43303571428571e-09 | 0.001 |
| 2.43526785714285e-09 | 0.001 |
| 2.43749999999999e-09 | 0.001 |
| 2.43973214285714e-09 | 0.001 |
| 2.44196428571428e-09 | 0.001 |
| 2.44419642857142e-09 | 0.001 |
| 2.44642857142857e-09 | 0.001 |
| 2.44866071428571e-09 | 0.001 |
| 2.45089285714285e-09 | 0.001 |
| 2.45312499999999e-09 | 0.001 |
| 2.45535714285714e-09 | 0.001 |
| 2.45758928571428e-09 | 0.001 |
| 2.45982142857142e-09 | 0.001 |
| 2.46205357142857e-09 | 0.001 |
| 2.46428571428571e-09 | 0 |
| 2.46651785714285e-09 | 0 |
| 2.46874999999999e-09 | 0 |
| 2.47098214285714e-09 | 0 |
| 2.47321428571428e-09 | 0 |
| 2.47544642857142e-09 | 0 |
| 2.47767857142857e-09 | 0 |
| 2.47991071428571e-09 | 0 |
| 2.48214285714285e-09 | 0 |
| 2.484375e-09 | 0 |
| 2.48660714285714e-09 | 0 |
| 2.48883928571428e-09 | 0 |
| 2.49107142857142e-09 | 0 |
| 2.49330357142857e-09 | 0 |
| 2.49553571428571e-09 | 0 |
| 2.49776785714285e-09 | 0 |
| 2.5e-09 | 0 |
| 2.50223214285714e-09 | 0 |
| 2.50446428571428e-09 | 0 |
| 2.50669642857142e-09 | 0 |
| 2.50892857142857e-09 | 0 |
| 2.51116071428571e-09 | 0 |
| 2.51339285714285e-09 | 0 |
| 2.515625e-09 | 0 |
| 2.51785714285714e-09 | 0 |
| 2.52008928571428e-09 | 0 |
| 2.52232142857142e-09 | 0 |
| 2.52455357142857e-09 | 0 |
| 2.52678571428571e-09 | 0 |
| 2.52901785714285e-09 | 0 |
| 2.53124999999999e-09 | 0 |
| 2.53348214285714e-09 | 0 |
| 2.53571428571428e-09 | 0 |
| 2.53794642857142e-09 | 0 |
| 2.54017857142857e-09 | 0 |
| 2.54241071428571e-09 | 0 |
| 2.54464285714285e-09 | 0 |
| 2.54687499999999e-09 | 0 |
| 2.54910714285714e-09 | 0 |
| 2.55133928571428e-09 | 0 |
| 2.55357142857142e-09 | 0 |
| 2.55580357142857e-09 | 0 |
| 2.55803571428571e-09 | 0 |
| 2.56026785714285e-09 | 0 |
| 2.56249999999999e-09 | 0 |
| 2.56473214285714e-09 | 0 |
| 2.56696428571428e-09 | 0 |
| 2.56919642857142e-09 | 0 |
| 2.57142857142857e-09 | 0 |
| 2.57366071428571e-09 | 0 |
| 2.57589285714285e-09 | 0 |
| 2.578125e-09 | 0 |
| 2.58035714285714e-09 | 0 |
| 2.58258928571428e-09 | 0 |
| 2.58482142857142e-09 | 0 |
| 2.58705357142857e-09 | 0 |
| 2.58928571428571e-09 | 0 |
| 2.59151785714285e-09 | 0 |
| 2.59375e-09 | 0 |
| 2.59598214285714e-09 | 0 |
| 2.59821428571428e-09 | 0 |
| 2.60044642857142e-09 | 0 |
| 2.60267857142857e-09 | 0 |
| 2.60491071428571e-09 | 0 |
| 2.60714285714285e-09 | 0 |
| 2.609375e-09 | 0 |
| 2.61160714285714e-09 | 0 |
| 2.61383928571428e-09 | 0 |
| 2.61607142857142e-09 | 0 |
| 2.61830357142857e-09 | 0 |
| 2.62053571428571e-09 | 0 |
| 2.62276785714285e-09 | 0 |
| 2.62499999999999e-09 | 0 |
| 2.62723214285714e-09 | 0 |
| 2.62946428571428e-09 | 0 |
| 2.63169642857142e-09 | 0 |
| 2.63392857142857e-09 | 0 |
| 2.63616071428571e-09 | 0 |
| 2.63839285714285e-09 | 0 |
| 2.64062499999999e-09 | 0 |
| 2.64285714285714e-09 | 0 |
| 2.64508928571428e-09 | 0 |
| 2.64732142857142e-09 | 0 |
| 2.64955357142857e-09 | 0 |
| 2.65178571428571e-09 | 0 |
| 2.65401785714285e-09 | 0 |
| 2.65624999999999e-09 | 0 |
| 2.65848214285714e-09 | 0 |
| 2.66071428571428e-09 | 0 |
| 2.66294642857142e-09 | 0 |
| 2.66517857142857e-09 | 0 |
| 2.66741071428571e-09 | 0 |
| 2.66964285714285e-09 | 0 |
| 2.671875e-09 | 0 |
| 2.67410714285714e-09 | 0 |
| 2.67633928571428e-09 | 0 |
| 2.67857142857142e-09 | 0.001 |
| 2.68080357142857e-09 | 0.001 |
| 2.68303571428571e-09 | 0.001 |
| 2.68526785714285e-09 | 0.001 |
| 2.6875e-09 | 0.001 |
| 2.68973214285714e-09 | 0.001 |
| 2.69196428571428e-09 | 0.001 |
| 2.69419642857142e-09 | 0.001 |
| 2.69642857142857e-09 | 0.001 |
| 2.69866071428571e-09 | 0.001 |
| 2.70089285714285e-09 | 0.001 |
| 2.703125e-09 | 0.001 |
| 2.70535714285714e-09 | 0.001 |
| 2.70758928571428e-09 | 0.001 |
| 2.70982142857142e-09 | 0.001 |
| 2.71205357142857e-09 | 0.001 |
| 2.71428571428571e-09 | 0.001 |
| 2.71651785714285e-09 | 0.001 |
| 2.71874999999999e-09 | 0.001 |
| 2.72098214285714e-09 | 0.001 |
| 2.72321428571428e-09 | 0.001 |
| 2.72544642857142e-09 | 0.001 |
| 2.72767857142857e-09 | 0.001 |
| 2.72991071428571e-09 | 0.001 |
| 2.73214285714285e-09 | 0.001 |
| 2.73437499999999e-09 | 0.001 |
| 2.73660714285714e-09 | 0.001 |
| 2.73883928571428e-09 | 0.001 |
| 2.74107142857142e-09 | 0.001 |
| 2.74330357142857e-09 | 0.001 |
| 2.74553571428571e-09 | 0.001 |
| 2.74776785714285e-09 | 0.001 |
| 2.74999999999999e-09 | 0.001 |
| 2.75223214285714e-09 | 0.001 |
| 2.75446428571428e-09 | 0.001 |
| 2.75669642857142e-09 | 0.001 |
| 2.75892857142857e-09 | 0.001 |
| 2.76116071428571e-09 | 0.001 |
| 2.76339285714285e-09 | 0.001 |
| 2.765625e-09 | 0.001 |
| 2.76785714285714e-09 | 0.001 |
| 2.77008928571428e-09 | 0.001 |
| 2.77232142857142e-09 | 0.001 |
| 2.77455357142857e-09 | 0.001 |
| 2.77678571428571e-09 | 0.001 |
| 2.77901785714285e-09 | 0.001 |
| 2.78125e-09 | 0.001 |
| 2.78348214285714e-09 | 0.001 |
| 2.78571428571428e-09 | 0 |
| 2.78794642857142e-09 | 0 |
| 2.79017857142857e-09 | 0 |
| 2.79241071428571e-09 | 0 |
| 2.79464285714285e-09 | 0 |
| 2.796875e-09 | 0 |
| 2.79910714285714e-09 | 0 |
| 2.80133928571428e-09 | 0 |
| 2.80357142857142e-09 | 0 |
| 2.80580357142857e-09 | 0 |
| 2.80803571428571e-09 | 0 |
| 2.81026785714285e-09 | 0 |
| 2.8125e-09 | 0 |
| 2.81473214285714e-09 | 0 |
| 2.81696428571428e-09 | 0 |
| 2.81919642857142e-09 | 0 |
| 2.82142857142857e-09 | 0.001 |
| 2.82366071428571e-09 | 0.001 |
| 2.82589285714285e-09 | 0.001 |
| 2.82812499999999e-09 | 0.001 |
| 2.83035714285714e-09 | 0.001 |
| 2.83258928571428e-09 | 0.001 |
| 2.83482142857142e-09 | 0.001 |
| 2.83705357142857e-09 | 0.001 |
| 2.83928571428571e-09 | 0.001 |
| 2.84151785714285e-09 | 0.001 |
| 2.84374999999999e-09 | 0.001 |
| 2.84598214285714e-09 | 0.001 |
| 2.84821428571428e-09 | 0.001 |
| 2.85044642857142e-09 | 0.001 |
| 2.85267857142857e-09 | 0.001 |
| 2.85491071428571e-09 | 0.001 |
| 2.85714285714285e-09 | 0.001 |
| 2.85937499999999e-09 | 0.001 |
| 2.86160714285714e-09 | 0.001 |
| 2.86383928571428e-09 | 0.001 |
| 2.86607142857142e-09 | 0.001 |
| 2.86830357142857e-09 | 0.001 |
| 2.87053571428571e-09 | 0.001 |
| 2.87276785714285e-09 | 0.001 |
| 2.875e-09 | 0.001 |
| 2.87723214285714e-09 | 0.001 |
| 2.87946428571428e-09 | 0.001 |
| 2.88169642857142e-09 | 0.001 |
| 2.88392857142857e-09 | 0.001 |
| 2.88616071428571e-09 | 0.001 |
| 2.88839285714285e-09 | 0.001 |
| 2.890625e-09 | 0.001 |
| 2.89285714285714e-09 | 0.001 |
| 2.89508928571428e-09 | 0.001 |
| 2.89732142857142e-09 | 0.001 |
| 2.89955357142857e-09 | 0.001 |
| 2.90178571428571e-09 | 0.001 |
| 2.90401785714285e-09 | 0.001 |
| 2.90625e-09 | 0.001 |
| 2.90848214285714e-09 | 0.001 |
| 2.91071428571428e-09 | 0.001 |
| 2.91294642857142e-09 | 0.001 |
| 2.91517857142857e-09 | 0.001 |
| 2.91741071428571e-09 | 0.001 |
| 2.91964285714285e-09 | 0.001 |
| 2.92187499999999e-09 | 0.001 |
| 2.92410714285714e-09 | 0.001 |
| 2.92633928571428e-09 | 0.001 |
| 2.92857142857142e-09 | 0 |
| 2.93080357142857e-09 | 0 |
| 2.93303571428571e-09 | 0 |
| 2.93526785714285e-09 | 0 |
| 2.93749999999999e-09 | 0 |
| 2.93973214285714e-09 | 0 |
| 2.94196428571428e-09 | 0 |
| 2.94419642857142e-09 | 0 |
| 2.94642857142857e-09 | 0 |
| 2.94866071428571e-09 | 0 |
| 2.95089285714285e-09 | 0 |
| 2.95312499999999e-09 | 0 |
| 2.95535714285714e-09 | 0 |
| 2.95758928571428e-09 | 0 |
| 2.95982142857142e-09 | 0 |
| 2.96205357142857e-09 | 0 |
| 2.96428571428571e-09 | 0 |
| 2.96651785714285e-09 | 0 |
| 2.96875e-09 | 0 |
| 2.97098214285714e-09 | 0 |
| 2.97321428571428e-09 | 0 |
| 2.97544642857142e-09 | 0 |
| 2.97767857142857e-09 | 0 |
| 2.97991071428571e-09 | 0 |
| 2.98214285714285e-09 | 0 |
| 2.984375e-09 | 0 |
| 2.98660714285714e-09 | 0 |
| 2.98883928571428e-09 | 0 |
| 2.99107142857142e-09 | 0 |
| 2.99330357142857e-09 | 0 |
| 2.99553571428571e-09 | 0 |
| 2.99776785714285e-09 | 0 |
| 3e-09 | 0 |
| 3.00223214285714e-09 | 0 |
| 3.00446428571428e-09 | 0 |
| 3.00669642857142e-09 | 0 |
| 3.00892857142857e-09 | 0 |
| 3.01116071428571e-09 | 0 |
| 3.01339285714285e-09 | 0 |
| 3.01562499999999e-09 | 0 |
| 3.01785714285714e-09 | 0 |
| 3.02008928571428e-09 | 0 |
| 3.02232142857142e-09 | 0 |
| 3.02455357142857e-09 | 0 |
| 3.02678571428571e-09 | 0 |
| 3.02901785714285e-09 | 0 |
| 3.03124999999999e-09 | 0 |
| 3.03348214285714e-09 | 0 |
| 3.03571428571428e-09 | 0 |
| 3.03794642857142e-09 | 0 |
| 3.04017857142857e-09 | 0 |
| 3.04241071428571e-09 | 0 |
| 3.04464285714285e-09 | 0 |
| 3.04687499999999e-09 | 0 |
| 3.04910714285714e-09 | 0 |
| 3.05133928571428e-09 | 0 |
| 3.05357142857142e-09 | 0 |
| 3.05580357142857e-09 | 0 |
| 3.05803571428571e-09 | 0 |
| 3.06026785714285e-09 | 0 |
| 3.0625e-09 | 0 |
| 3.06473214285714e-09 | 0 |
| 3.06696428571428e-09 | 0 |
| 3.06919642857142e-09 | 0 |
| 3.07142857142857e-09 | 0.001 |
| 3.07366071428571e-09 | 0.001 |
| 3.07589285714285e-09 | 0.001 |
| 3.078125e-09 | 0.001 |
| 3.08035714285714e-09 | 0.001 |
| 3.08258928571428e-09 | 0.001 |
| 3.08482142857142e-09 | 0.001 |
| 3.08705357142857e-09 | 0.001 |
| 3.08928571428571e-09 | 0.001 |
| 3.09151785714285e-09 | 0.001 |
| 3.09375e-09 | 0.001 |
| 3.09598214285714e-09 | 0.001 |
| 3.09821428571428e-09 | 0.001 |
| 3.10044642857142e-09 | 0.001 |
| 3.10267857142857e-09 | 0.001 |
| 3.10491071428571e-09 | 0.001 |
| 3.10714285714285e-09 | 0.001 |
| 3.10937499999999e-09 | 0.001 |
| 3.11160714285714e-09 | 0.001 |
| 3.11383928571428e-09 | 0.001 |
| 3.11607142857142e-09 | 0.001 |
| 3.11830357142857e-09 | 0.001 |
| 3.12053571428571e-09 | 0.001 |
| 3.12276785714285e-09 | 0.001 |
| 3.12499999999999e-09 | 0.001 |
| 3.12723214285714e-09 | 0.001 |
| 3.12946428571428e-09 | 0.001 |
| 3.13169642857142e-09 | 0.001 |
| 3.13392857142857e-09 | 0.001 |
| 3.13616071428571e-09 | 0.001 |
| 3.13839285714285e-09 | 0.001 |
| 3.14062499999999e-09 | 0.001 |
| 3.14285714285714e-09 | 0 |
| 3.14508928571428e-09 | 0 |
| 3.14732142857142e-09 | 0 |
| 3.14955357142857e-09 | 0 |
| 3.15178571428571e-09 | 0 |
| 3.15401785714285e-09 | 0 |
| 3.15625e-09 | 0 |
| 3.15848214285714e-09 | 0 |
| 3.16071428571428e-09 | 0 |
| 3.16294642857142e-09 | 0 |
| 3.16517857142857e-09 | 0 |
| 3.16741071428571e-09 | 0 |
| 3.16964285714285e-09 | 0 |
| 3.171875e-09 | 0 |
| 3.17410714285714e-09 | 0 |
| 3.17633928571428e-09 | 0 |
| 3.17857142857142e-09 | 0 |
| 3.18080357142857e-09 | 0 |
| 3.18303571428571e-09 | 0 |
| 3.18526785714285e-09 | 0 |
| 3.1875e-09 | 0 |
| 3.18973214285714e-09 | 0 |
| 3.19196428571428e-09 | 0 |
| 3.19419642857142e-09 | 0 |
| 3.19642857142857e-09 | 0 |
| 3.19866071428571e-09 | 0 |
| 3.20089285714285e-09 | 0 |
| 3.20312499999999e-09 | 0 |
| 3.20535714285714e-09 | 0 |
| 3.20758928571428e-09 | 0 |
| 3.20982142857142e-09 | 0 |
| 3.21205357142857e-09 | 0 |
| 3.21428571428571e-09 | 0 |
| 3.21651785714285e-09 | 0 |
| 3.21874999999999e-09 | 0 |
| 3.22098214285714e-09 | 0 |
| 3.22321428571428e-09 | 0 |
| 3.22544642857142e-09 | 0 |
| 3.22767857142857e-09 | 0 |
| 3.22991071428571e-09 | 0 |
| 3.23214285714285e-09 | 0 |
| 3.23437499999999e-09 | 0 |
| 3.23660714285714e-09 | 0 |
| 3.23883928571428e-09 | 0 |
| 3.24107142857142e-09 | 0 |
| 3.24330357142857e-09 | 0 |
| 3.24553571428571e-09 | 0 |
| 3.24776785714285e-09 | 0 |
| 3.25e-09 | 0 |
| 3.25223214285714e-09 | 0 |
| 3.25446428571428e-09 | 0 |
| 3.25669642857142e-09 | 0 |
| 3.25892857142857e-09 | 0 |
| 3.26116071428571e-09 | 0 |
| 3.26339285714285e-09 | 0 |
| 3.265625e-09 | 0 |
| 3.26785714285714e-09 | 0 |
| 3.27008928571428e-09 | 0 |
| 3.27232142857142e-09 | 0 |
| 3.27455357142857e-09 | 0 |
| 3.27678571428571e-09 | 0 |
| 3.27901785714285e-09 | 0 |
| 3.28125e-09 | 0 |
| 3.28348214285714e-09 | 0 |
| 3.28571428571428e-09 | 0.001 |
| 3.28794642857142e-09 | 0.001 |
| 3.29017857142857e-09 | 0.001 |
| 3.29241071428571e-09 | 0.001 |
| 3.29464285714285e-09 | 0.001 |
| 3.296875e-09 | 0.001 |
| 3.29910714285714e-09 | 0.001 |
| 3.30133928571428e-09 | 0.001 |
| 3.30357142857142e-09 | 0.001 |
| 3.30580357142857e-09 | 0.001 |
| 3.30803571428571e-09 | 0.001 |
| 3.31026785714285e-09 | 0.001 |
| 3.31249999999999e-09 | 0.001 |
| 3.31473214285714e-09 | 0.001 |
| 3.31696428571428e-09 | 0.001 |
| 3.31919642857142e-09 | 0.001 |
| 3.32142857142857e-09 | 0 |
| 3.32366071428571e-09 | 0 |
| 3.32589285714285e-09 | 0 |
| 3.32812499999999e-09 | 0 |
| 3.33035714285714e-09 | 0 |
| 3.33258928571428e-09 | 0 |
| 3.33482142857142e-09 | 0 |
| 3.33705357142857e-09 | 0 |
| 3.33928571428571e-09 | 0 |
| 3.34151785714285e-09 | 0 |
| 3.34374999999999e-09 | 0 |
| 3.34598214285714e-09 | 0 |
| 3.34821428571428e-09 | 0 |
| 3.35044642857142e-09 | 0 |
| 3.35267857142857e-09 | 0 |
| 3.35491071428571e-09 | 0 |
| 3.35714285714285e-09 | 0 |
| 3.359375e-09 | 0 |
| 3.36160714285714e-09 | 0 |
| 3.36383928571428e-09 | 0 |
| 3.36607142857142e-09 | 0 |
| 3.36830357142857e-09 | 0 |
| 3.37053571428571e-09 | 0 |
| 3.37276785714285e-09 | 0 |
| 3.375e-09 | 0 |
| 3.37723214285714e-09 | 0 |
| 3.37946428571428e-09 | 0 |
| 3.38169642857142e-09 | 0 |
| 3.38392857142857e-09 | 0 |
| 3.38616071428571e-09 | 0 |
| 3.38839285714285e-09 | 0 |
| 3.390625e-09 | 0 |
| 3.39285714285714e-09 | 0.001 |
| 3.39508928571428e-09 | 0.001 |
| 3.39732142857142e-09 | 0.001 |
| 3.39955357142857e-09 | 0.001 |
| 3.40178571428571e-09 | 0.001 |
| 3.40401785714285e-09 | 0.001 |
| 3.40624999999999e-09 | 0.001 |
| 3.40848214285714e-09 | 0.001 |
| 3.41071428571428e-09 | 0.001 |
| 3.41294642857142e-09 | 0.001 |
| 3.41517857142857e-09 | 0.001 |
| 3.41741071428571e-09 | 0.001 |
| 3.41964285714285e-09 | 0.001 |
| 3.42187499999999e-09 | 0.001 |
| 3.42410714285714e-09 | 0.001 |
| 3.42633928571428e-09 | 0.001 |
| 3.42857142857142e-09 | 0 |
| 3.43080357142857e-09 | 0 |
| 3.43303571428571e-09 | 0 |
| 3.43526785714285e-09 | 0 |
| 3.43749999999999e-09 | 0 |
| 3.43973214285714e-09 | 0 |
| 3.44196428571428e-09 | 0 |
| 3.44419642857142e-09 | 0 |
| 3.44642857142857e-09 | 0 |
| 3.44866071428571e-09 | 0 |
| 3.45089285714285e-09 | 0 |
| 3.453125e-09 | 0 |
| 3.45535714285714e-09 | 0 |
| 3.45758928571428e-09 | 0 |
| 3.45982142857142e-09 | 0 |
| 3.46205357142857e-09 | 0 |
| 3.46428571428571e-09 | 0 |
| 3.46651785714285e-09 | 0 |
| 3.46875e-09 | 0 |
| 3.47098214285714e-09 | 0 |
| 3.47321428571428e-09 | 0 |
| 3.47544642857142e-09 | 0 |
| 3.47767857142857e-09 | 0 |
| 3.47991071428571e-09 | 0 |
| 3.48214285714285e-09 | 0 |
| 3.484375e-09 | 0 |
| 3.48660714285714e-09 | 0 |
| 3.48883928571428e-09 | 0 |
| 3.49107142857142e-09 | 0 |
| 3.49330357142857e-09 | 0 |
| 3.49553571428571e-09 | 0 |
| 3.49776785714285e-09 | 0 |
| 3.49999999999999e-09 | 0.001 |
| 3.50223214285714e-09 | 0.001 |
| 3.50446428571428e-09 | 0.001 |
| 3.50669642857142e-09 | 0.001 |
| 3.50892857142857e-09 | 0.001 |
| 3.51116071428571e-09 | 0.001 |
| 3.51339285714285e-09 | 0.001 |
| 3.51562499999999e-09 | 0.001 |
| 3.51785714285714e-09 | 0.001 |
| 3.52008928571428e-09 | 0.001 |
| 3.52232142857142e-09 | 0.001 |
| 3.52455357142857e-09 | 0.001 |
| 3.52678571428571e-09 | 0.001 |
| 3.52901785714285e-09 | 0.001 |
| 3.53124999999999e-09 | 0.001 |
| 3.53348214285714e-09 | 0.001 |
| 3.53571428571428e-09 | 0 |
| 3.53794642857142e-09 | 0 |
| 3.54017857142857e-09 | 0 |
| 3.54241071428571e-09 | 0 |
| 3.54464285714285e-09 | 0 |
| 3.546875e-09 | 0 |
| 3.54910714285714e-09 | 0 |
| 3.55133928571428e-09 | 0 |
| 3.55357142857142e-09 | 0 |
| 3.55580357142857e-09 | 0 |
| 3.55803571428571e-09 | 0 |
| 3.56026785714285e-09 | 0 |
| 3.5625e-09 | 0 |
| 3.56473214285714e-09 | 0 |
| 3.56696428571428e-09 | 0 |
| 3.56919642857142e-09 | 0 |
| 3.57142857142857e-09 | 0.001 |
| 3.57366071428571e-09 | 0.001 |
| 3.57589285714285e-09 | 0.001 |
| 3.578125e-09 | 0.001 |
| 3.58035714285714e-09 | 0.001 |
| 3.58258928571428e-09 | 0.001 |
| 3.58482142857142e-09 | 0.001 |
| 3.58705357142857e-09 | 0.001 |
| 3.58928571428571e-09 | 0.001 |
| 3.59151785714285e-09 | 0.001 |
| 3.59374999999999e-09 | 0.001 |
| 3.59598214285714e-09 | 0.001 |
| 3.59821428571428e-09 | 0.001 |
| 3.60044642857142e-09 | 0.001 |
| 3.60267857142857e-09 | 0.001 |
| 3.60491071428571e-09 | 0.001 |
| 3.60714285714285e-09 | 0.001 |
| 3.60937499999999e-09 | 0.001 |
| 3.61160714285714e-09 | 0.001 |
| 3.61383928571428e-09 | 0.001 |
| 3.61607142857142e-09 | 0.001 |
| 3.61830357142857e-09 | 0.001 |
| 3.62053571428571e-09 | 0.001 |
| 3.62276785714285e-09 | 0.001 |
| 3.62499999999999e-09 | 0.001 |
| 3.62723214285714e-09 | 0.001 |
| 3.62946428571428e-09 | 0.001 |
| 3.63169642857142e-09 | 0.001 |
| 3.63392857142857e-09 | 0.001 |
| 3.63616071428571e-09 | 0.001 |
| 3.63839285714285e-09 | 0.001 |
| 3.640625e-09 | 0.001 |
| 3.64285714285714e-09 | 0.001 |
| 3.64508928571428e-09 | 0.001 |
| 3.64732142857142e-09 | 0.001 |
| 3.64955357142857e-09 | 0.001 |
| 3.65178571428571e-09 | 0.001 |
| 3.65401785714285e-09 | 0.001 |
| 3.65625e-09 | 0.001 |
| 3.65848214285714e-09 | 0.001 |
| 3.66071428571428e-09 | 0.001 |
| 3.66294642857142e-09 | 0.001 |
| 3.66517857142857e-09 | 0.001 |
| 3.66741071428571e-09 | 0.001 |
| 3.66964285714285e-09 | 0.001 |
| 3.671875e-09 | 0.001 |
| 3.67410714285714e-09 | 0.001 |
| 3.67633928571428e-09 | 0.001 |
| 3.67857142857142e-09 | 0.001 |
| 3.68080357142857e-09 | 0.001 |
| 3.68303571428571e-09 | 0.001 |
| 3.68526785714285e-09 | 0.001 |
| 3.68749999999999e-09 | 0.001 |
| 3.68973214285714e-09 | 0.001 |
| 3.69196428571428e-09 | 0.001 |
| 3.69419642857142e-09 | 0.001 |
| 3.69642857142857e-09 | 0.001 |
| 3.69866071428571e-09 | 0.001 |
| 3.70089285714285e-09 | 0.001 |
| 3.70312499999999e-09 | 0.001 |
| 3.70535714285714e-09 | 0.001 |
| 3.70758928571428e-09 | 0.001 |
| 3.70982142857142e-09 | 0.001 |
| 3.71205357142857e-09 | 0.001 |
| 3.71428571428571e-09 | 0.001 |
| 3.71651785714285e-09 | 0.001 |
| 3.71874999999999e-09 | 0.001 |
| 3.72098214285714e-09 | 0.001 |
| 3.72321428571428e-09 | 0.001 |
| 3.72544642857142e-09 | 0.001 |
| 3.72767857142857e-09 | 0.001 |
| 3.72991071428571e-09 | 0.001 |
| 3.73214285714285e-09 | 0.001 |
| 3.734375e-09 | 0.001 |
| 3.73660714285714e-09 | 0.001 |
| 3.73883928571428e-09 | 0.001 |
| 3.74107142857142e-09 | 0.001 |
| 3.74330357142857e-09 | 0.001 |
| 3.74553571428571e-09 | 0.001 |
| 3.74776785714285e-09 | 0.001 |
| 3.74999999999999e-09 | 0.001 |
| 3.75223214285714e-09 | 0.001 |
| 3.75446428571428e-09 | 0.001 |
| 3.75669642857142e-09 | 0.001 |
| 3.75892857142857e-09 | 0.001 |
| 3.76116071428571e-09 | 0.001 |
| 3.76339285714285e-09 | 0.001 |
| 3.765625e-09 | 0.001 |
| 3.76785714285714e-09 | 0.001 |
| 3.77008928571428e-09 | 0.001 |
| 3.77232142857142e-09 | 0.001 |
| 3.77455357142857e-09 | 0.001 |
| 3.77678571428571e-09 | 0.001 |
| 3.77901785714285e-09 | 0.001 |
| 3.78124999999999e-09 | 0.001 |
| 3.78348214285714e-09 | 0.001 |
| 3.78571428571428e-09 | 0.001 |
| 3.78794642857142e-09 | 0.001 |
| 3.79017857142857e-09 | 0.001 |
| 3.79241071428571e-09 | 0.001 |
| 3.79464285714285e-09 | 0.001 |
| 3.79687499999999e-09 | 0.001 |
| 3.79910714285714e-09 | 0.001 |
| 3.80133928571428e-09 | 0.001 |
| 3.80357142857142e-09 | 0.001 |
| 3.80580357142857e-09 | 0.001 |
| 3.80803571428571e-09 | 0.001 |
| 3.81026785714285e-09 | 0.001 |
| 3.8125e-09 | 0.001 |
| 3.81473214285714e-09 | 0.001 |
| 3.81696428571428e-09 | 0.001 |
| 3.81919642857142e-09 | 0.001 |
| 3.82142857142857e-09 | 0 |
| 3.82366071428571e-09 | 0 |
| 3.82589285714285e-09 | 0 |
| 3.82812499999999e-09 | 0 |
| 3.83035714285714e-09 | 0 |
| 3.83258928571428e-09 | 0 |
| 3.83482142857142e-09 | 0 |
| 3.83705357142857e-09 | 0 |
| 3.83928571428571e-09 | 0 |
| 3.84151785714285e-09 | 0 |
| 3.84375e-09 | 0 |
| 3.84598214285714e-09 | 0 |
| 3.84821428571428e-09 | 0 |
| 3.85044642857142e-09 | 0 |
| 3.85267857142857e-09 | 0 |
| 3.85491071428571e-09 | 0 |
| 3.85714285714285e-09 | 0.001 |
| 3.85937499999999e-09 | 0.001 |
| 3.86160714285714e-09 | 0.001 |
| 3.86383928571428e-09 | 0.001 |
| 3.86607142857142e-09 | 0.001 |
| 3.86830357142857e-09 | 0.001 |
| 3.87053571428571e-09 | 0.001 |
| 3.87276785714285e-09 | 0.001 |
| 3.875e-09 | 0.001 |
| 3.87723214285714e-09 | 0.001 |
| 3.87946428571428e-09 | 0.001 |
| 3.88169642857142e-09 | 0.001 |
| 3.88392857142857e-09 | 0.001 |
| 3.88616071428571e-09 | 0.001 |
| 3.88839285714285e-09 | 0.001 |
| 3.890625e-09 | 0.001 |
| 3.89285714285714e-09 | 0 |
| 3.89508928571428e-09 | 0 |
| 3.89732142857142e-09 | 0 |
| 3.89955357142857e-09 | 0 |
| 3.90178571428571e-09 | 0 |
| 3.90401785714285e-09 | 0 |
| 3.90624999999999e-09 | 0 |
| 3.90848214285714e-09 | 0 |
| 3.91071428571428e-09 | 0 |
| 3.91294642857142e-09 | 0 |
| 3.91517857142857e-09 | 0 |
| 3.91741071428571e-09 | 0 |
| 3.91964285714285e-09 | 0 |
| 3.921875e-09 | 0 |
| 3.92410714285714e-09 | 0 |
| 3.92633928571428e-09 | 0 |
| 3.92857142857142e-09 | 0.001 |
| 3.93080357142857e-09 | 0.001 |
| 3.93303571428571e-09 | 0.001 |
| 3.93526785714285e-09 | 0.001 |
| 3.93749999999999e-09 | 0.001 |
| 3.93973214285714e-09 | 0.001 |
| 3.94196428571428e-09 | 0.001 |
| 3.94419642857142e-09 | 0.001 |
| 3.94642857142857e-09 | 0.001 |
| 3.94866071428571e-09 | 0.001 |
| 3.95089285714285e-09 | 0.001 |
| 3.953125e-09 | 0.001 |
| 3.95535714285714e-09 | 0.001 |
| 3.95758928571428e-09 | 0.001 |
| 3.95982142857142e-09 | 0.001 |
| 3.96205357142857e-09 | 0.001 |
| 3.96428571428571e-09 | 0.001 |
| 3.96651785714285e-09 | 0.001 |
| 3.96874999999999e-09 | 0.001 |
| 3.97098214285714e-09 | 0.001 |
| 3.97321428571428e-09 | 0.001 |
| 3.97544642857142e-09 | 0.001 |
| 3.97767857142857e-09 | 0.001 |
| 3.97991071428571e-09 | 0.001 |
| 3.98214285714285e-09 | 0.001 |
| 3.98437499999999e-09 | 0.001 |
| 3.98660714285714e-09 | 0.001 |
| 3.98883928571428e-09 | 0.001 |
| 3.99107142857142e-09 | 0.001 |
| 3.99330357142857e-09 | 0.001 |
| 3.99553571428571e-09 | 0.001 |
| 3.99776785714285e-09 | 0.001 |
| 4e-09 | 0.001 |
| 4.00223214285714e-09 | 0.001 |
| 4.00446428571428e-09 | 0.001 |
| 4.00669642857142e-09 | 0.001 |
| 4.00892857142857e-09 | 0.001 |
| 4.01116071428571e-09 | 0.001 |
| 4.01339285714285e-09 | 0.001 |
| 4.01562499999999e-09 | 0.001 |
| 4.01785714285714e-09 | 0.001 |
| 4.02008928571428e-09 | 0.001 |
| 4.02232142857142e-09 | 0.001 |
| 4.02455357142857e-09 | 0.001 |
| 4.02678571428571e-09 | 0.001 |
| 4.02901785714285e-09 | 0.001 |
| 4.03125e-09 | 0.001 |
| 4.03348214285714e-09 | 0.001 |
| 4.03571428571428e-09 | 0.001 |
| 4.03794642857142e-09 | 0.001 |
| 4.04017857142857e-09 | 0.001 |
| 4.04241071428571e-09 | 0.001 |
| 4.04464285714285e-09 | 0.001 |
| 4.04687499999999e-09 | 0.001 |
| 4.04910714285714e-09 | 0.001 |
| 4.05133928571428e-09 | 0.001 |
| 4.05357142857142e-09 | 0.001 |
| 4.05580357142857e-09 | 0.001 |
| 4.05803571428571e-09 | 0.001 |
| 4.06026785714285e-09 | 0.001 |
| 4.0625e-09 | 0.001 |
| 4.06473214285714e-09 | 0.001 |
| 4.06696428571428e-09 | 0.001 |
| 4.06919642857142e-09 | 0.001 |
| 4.07142857142857e-09 | 0 |
| 4.07366071428571e-09 | 0 |
| 4.07589285714285e-09 | 0 |
| 4.078125e-09 | 0 |
| 4.08035714285714e-09 | 0 |
| 4.08258928571428e-09 | 0 |
| 4.08482142857142e-09 | 0 |
| 4.08705357142857e-09 | 0 |
| 4.08928571428571e-09 | 0 |
| 4.09151785714285e-09 | 0 |
| 4.09374999999999e-09 | 0 |
| 4.09598214285714e-09 | 0 |
| 4.09821428571428e-09 | 0 |
| 4.10044642857142e-09 | 0 |
| 4.10267857142857e-09 | 0 |
| 4.10491071428571e-09 | 0 |
| 4.10714285714285e-09 | 0.001 |
| 4.109375e-09 | 0.001 |
| 4.11160714285714e-09 | 0.001 |
| 4.11383928571428e-09 | 0.001 |
| 4.11607142857142e-09 | 0.001 |
| 4.11830357142857e-09 | 0.001 |
| 4.12053571428571e-09 | 0.001 |
| 4.12276785714285e-09 | 0.001 |
| 4.12499999999999e-09 | 0.001 |
| 4.12723214285714e-09 | 0.001 |
| 4.12946428571428e-09 | 0.001 |
| 4.13169642857142e-09 | 0.001 |
| 4.13392857142857e-09 | 0.001 |
| 4.13616071428571e-09 | 0.001 |
| 4.13839285714285e-09 | 0.001 |
| 4.140625e-09 | 0.001 |
| 4.14285714285714e-09 | 0 |
| 4.14508928571428e-09 | 0 |
| 4.14732142857142e-09 | 0 |
| 4.14955357142857e-09 | 0 |
| 4.15178571428571e-09 | 0 |
| 4.15401785714285e-09 | 0 |
| 4.15624999999999e-09 | 0 |
| 4.15848214285714e-09 | 0 |
| 4.16071428571428e-09 | 0 |
| 4.16294642857142e-09 | 0 |
| 4.16517857142857e-09 | 0 |
| 4.16741071428571e-09 | 0 |
| 4.16964285714285e-09 | 0 |
| 4.17187499999999e-09 | 0 |
| 4.17410714285714e-09 | 0 |
| 4.17633928571428e-09 | 0 |
| 4.17857142857142e-09 | 0 |
| 4.18080357142857e-09 | 0 |
| 4.18303571428571e-09 | 0 |
| 4.18526785714285e-09 | 0 |
| 4.1875e-09 | 0 |
| 4.18973214285714e-09 | 0 |
| 4.19196428571428e-09 | 0 |
| 4.19419642857142e-09 | 0 |
| 4.19642857142857e-09 | 0 |
| 4.19866071428571e-09 | 0 |
| 4.20089285714285e-09 | 0 |
| 4.20312499999999e-09 | 0 |
| 4.20535714285714e-09 | 0 |
| 4.20758928571428e-09 | 0 |
| 4.20982142857142e-09 | 0 |
| 4.21205357142857e-09 | 0 |
| 4.21428571428571e-09 | 0.001 |
| 4.21651785714285e-09 | 0.001 |
| 4.21875e-09 | 0.001 |
| 4.22098214285714e-09 | 0.001 |
| 4.22321428571428e-09 | 0.001 |
| 4.22544642857142e-09 | 0.001 |
| 4.22767857142857e-09 | 0.001 |
| 4.22991071428571e-09 | 0.001 |
| 4.23214285714285e-09 | 0.001 |
| 4.23437499999999e-09 | 0.001 |
| 4.23660714285714e-09 | 0.001 |
| 4.23883928571428e-09 | 0.001 |
| 4.24107142857142e-09 | 0.001 |
| 4.24330357142857e-09 | 0.001 |
| 4.24553571428571e-09 | 0.001 |
| 4.24776785714285e-09 | 0.001 |
| 4.25e-09 | 0 |
| 4.25223214285714e-09 | 0 |
| 4.25446428571428e-09 | 0 |
| 4.25669642857142e-09 | 0 |
| 4.25892857142857e-09 | 0 |
| 4.26116071428571e-09 | 0 |
| 4.26339285714285e-09 | 0 |
| 4.26562499999999e-09 | 0 |
| 4.26785714285714e-09 | 0 |
| 4.27008928571428e-09 | 0 |
| 4.27232142857142e-09 | 0 |
| 4.27455357142857e-09 | 0 |
| 4.27678571428571e-09 | 0 |
| 4.27901785714285e-09 | 0 |
| 4.28124999999999e-09 | 0 |
| 4.28348214285714e-09 | 0 |
| 4.28571428571428e-09 | 0.001 |
| 4.28794642857142e-09 | 0.001 |
| 4.29017857142857e-09 | 0.001 |
| 4.29241071428571e-09 | 0.001 |
| 4.29464285714285e-09 | 0.001 |
| 4.296875e-09 | 0.001 |
| 4.29910714285714e-09 | 0.001 |
| 4.30133928571428e-09 | 0.001 |
| 4.30357142857142e-09 | 0.001 |
| 4.30580357142857e-09 | 0.001 |
| 4.30803571428571e-09 | 0.001 |
| 4.31026785714285e-09 | 0.001 |
| 4.31249999999999e-09 | 0.001 |
| 4.31473214285714e-09 | 0.001 |
| 4.31696428571428e-09 | 0.001 |
| 4.31919642857142e-09 | 0.001 |
| 4.32142857142857e-09 | 0 |
| 4.32366071428571e-09 | 0 |
| 4.32589285714285e-09 | 0 |
| 4.328125e-09 | 0 |
| 4.33035714285714e-09 | 0 |
| 4.33258928571428e-09 | 0 |
| 4.33482142857142e-09 | 0 |
| 4.33705357142857e-09 | 0 |
| 4.33928571428571e-09 | 0 |
| 4.34151785714285e-09 | 0 |
| 4.34374999999999e-09 | 0 |
| 4.34598214285714e-09 | 0 |
| 4.34821428571428e-09 | 0 |
| 4.35044642857142e-09 | 0 |
| 4.35267857142857e-09 | 0 |
| 4.35491071428571e-09 | 0 |
| 4.35714285714285e-09 | 0.001 |
| 4.359375e-09 | 0.001 |
| 4.36160714285714e-09 | 0.001 |
| 4.36383928571428e-09 | 0.001 |
| 4.36607142857142e-09 | 0.001 |
| 4.36830357142857e-09 | 0.001 |
| 4.37053571428571e-09 | 0.001 |
| 4.37276785714285e-09 | 0.001 |
| 4.375e-09 | 0.001 |
| 4.37723214285714e-09 | 0.001 |
| 4.37946428571428e-09 | 0.001 |
| 4.38169642857142e-09 | 0.001 |
| 4.38392857142857e-09 | 0.001 |
| 4.38616071428571e-09 | 0.001 |
| 4.38839285714285e-09 | 0.001 |
| 4.39062499999999e-09 | 0.001 |
| 4.39285714285714e-09 | 0 |
| 4.39508928571428e-09 | 0 |
| 4.39732142857142e-09 | 0 |
| 4.39955357142857e-09 | 0 |
| 4.40178571428571e-09 | 0 |
| 4.40401785714285e-09 | 0 |
| 4.40625e-09 | 0 |
| 4.40848214285714e-09 | 0 |
| 4.41071428571428e-09 | 0 |
| 4.41294642857142e-09 | 0 |
| 4.41517857142857e-09 | 0 |
| 4.41741071428571e-09 | 0 |
| 4.41964285714285e-09 | 0 |
| 4.42187499999999e-09 | 0 |
| 4.42410714285714e-09 | 0 |
| 4.42633928571428e-09 | 0 |
| 4.42857142857142e-09 | 0.001 |
| 4.43080357142857e-09 | 0.001 |
| 4.43303571428571e-09 | 0.001 |
| 4.43526785714285e-09 | 0.001 |
| 4.4375e-09 | 0.001 |
| 4.43973214285714e-09 | 0.001 |
| 4.44196428571428e-09 | 0.001 |
| 4.44419642857142e-09 | 0.001 |
| 4.44642857142857e-09 | 0.001 |
| 4.44866071428571e-09 | 0.001 |
| 4.45089285714285e-09 | 0.001 |
| 4.45312499999999e-09 | 0.001 |
| 4.45535714285714e-09 | 0.001 |
| 4.45758928571428e-09 | 0.001 |
| 4.45982142857142e-09 | 0.001 |
| 4.46205357142857e-09 | 0.001 |
| 4.46428571428571e-09 | 0.001 |
| 4.46651785714285e-09 | 0.001 |
| 4.46874999999999e-09 | 0.001 |
| 4.47098214285714e-09 | 0.001 |
| 4.47321428571428e-09 | 0.001 |
| 4.47544642857142e-09 | 0.001 |
| 4.47767857142857e-09 | 0.001 |
| 4.47991071428571e-09 | 0.001 |
| 4.48214285714285e-09 | 0.001 |
| 4.484375e-09 | 0.001 |
| 4.48660714285714e-09 | 0.001 |
| 4.48883928571428e-09 | 0.001 |
| 4.49107142857142e-09 | 0.001 |
| 4.49330357142857e-09 | 0.001 |
| 4.49553571428571e-09 | 0.001 |
| 4.49776785714285e-09 | 0.001 |
| 4.49999999999999e-09 | 0.001 |
| 4.50223214285714e-09 | 0.001 |
| 4.50446428571428e-09 | 0.001 |
| 4.50669642857142e-09 | 0.001 |
| 4.50892857142857e-09 | 0.001 |
| 4.51116071428571e-09 | 0.001 |
| 4.51339285714285e-09 | 0.001 |
| 4.515625e-09 | 0.001 |
| 4.51785714285714e-09 | 0.001 |
| 4.52008928571428e-09 | 0.001 |
| 4.52232142857142e-09 | 0.001 |
| 4.52455357142857e-09 | 0.001 |
| 4.52678571428571e-09 | 0.001 |
| 4.52901785714285e-09 | 0.001 |
| 4.53124999999999e-09 | 0.001 |
| 4.53348214285714e-09 | 0.001 |
| 4.53571428571428e-09 | 0 |
| 4.53794642857142e-09 | 0 |
| 4.54017857142857e-09 | 0 |
| 4.54241071428571e-09 | 0 |
| 4.54464285714285e-09 | 0 |
| 4.546875e-09 | 0 |
| 4.54910714285714e-09 | 0 |
| 4.55133928571428e-09 | 0 |
| 4.55357142857142e-09 | 0 |
| 4.55580357142857e-09 | 0 |
| 4.55803571428571e-09 | 0 |
| 4.56026785714285e-09 | 0 |
| 4.5625e-09 | 0 |
| 4.56473214285714e-09 | 0 |
| 4.56696428571428e-09 | 0 |
| 4.56919642857142e-09 | 0 |
| 4.57142857142857e-09 | 0 |
| 4.57366071428571e-09 | 0 |
| 4.57589285714285e-09 | 0 |
| 4.57812499999999e-09 | 0 |
| 4.58035714285714e-09 | 0 |
| 4.58258928571428e-09 | 0 |
| 4.58482142857142e-09 | 0 |
| 4.58705357142857e-09 | 0 |
| 4.58928571428571e-09 | 0 |
| 4.59151785714285e-09 | 0 |
| 4.59375e-09 | 0 |
| 4.59598214285714e-09 | 0 |
| 4.59821428571428e-09 | 0 |
| 4.60044642857142e-09 | 0 |
| 4.60267857142857e-09 | 0 |
| 4.60491071428571e-09 | 0 |
| 4.60714285714285e-09 | 0 |
| 4.60937499999999e-09 | 0 |
| 4.61160714285714e-09 | 0 |
| 4.61383928571428e-09 | 0 |
| 4.61607142857142e-09 | 0 |
| 4.61830357142857e-09 | 0 |
| 4.62053571428571e-09 | 0 |
| 4.62276785714285e-09 | 0 |
| 4.625e-09 | 0 |
| 4.62723214285714e-09 | 0 |
| 4.62946428571428e-09 | 0 |
| 4.63169642857142e-09 | 0 |
| 4.63392857142857e-09 | 0 |
| 4.63616071428571e-09 | 0 |
| 4.63839285714285e-09 | 0 |
| 4.64062499999999e-09 | 0 |
| 4.64285714285714e-09 | 0 |
| 4.64508928571428e-09 | 0 |
| 4.64732142857142e-09 | 0 |
| 4.64955357142857e-09 | 0 |
| 4.65178571428571e-09 | 0 |
| 4.65401785714285e-09 | 0 |
| 4.65624999999999e-09 | 0 |
| 4.65848214285714e-09 | 0 |
| 4.66071428571428e-09 | 0 |
| 4.66294642857142e-09 | 0 |
| 4.66517857142857e-09 | 0 |
| 4.66741071428571e-09 | 0 |
| 4.66964285714285e-09 | 0 |
| 4.671875e-09 | 0 |
| 4.67410714285714e-09 | 0 |
| 4.67633928571428e-09 | 0 |
| 4.67857142857142e-09 | 0 |
| 4.68080357142857e-09 | 0 |
| 4.68303571428571e-09 | 0 |
| 4.68526785714285e-09 | 0 |
| 4.68749999999999e-09 | 0 |
| 4.68973214285714e-09 | 0 |
| 4.69196428571428e-09 | 0 |
| 4.69419642857142e-09 | 0 |
| 4.69642857142857e-09 | 0 |
| 4.69866071428571e-09 | 0 |
| 4.70089285714285e-09 | 0 |
| 4.703125e-09 | 0 |
| 4.70535714285714e-09 | 0 |
| 4.70758928571428e-09 | 0 |
| 4.70982142857142e-09 | 0 |
| 4.71205357142857e-09 | 0 |
| 4.71428571428571e-09 | 0.001 |
| 4.71651785714285e-09 | 0.001 |
| 4.71874999999999e-09 | 0.001 |
| 4.72098214285714e-09 | 0.001 |
| 4.72321428571428e-09 | 0.001 |
| 4.72544642857142e-09 | 0.001 |
| 4.72767857142857e-09 | 0.001 |
| 4.72991071428571e-09 | 0.001 |
| 4.73214285714285e-09 | 0.001 |
| 4.734375e-09 | 0.001 |
| 4.73660714285714e-09 | 0.001 |
| 4.73883928571428e-09 | 0.001 |
| 4.74107142857142e-09 | 0.001 |
| 4.74330357142857e-09 | 0.001 |
| 4.74553571428571e-09 | 0.001 |
| 4.74776785714285e-09 | 0.001 |
| 4.74999999999999e-09 | 0 |
| 4.75223214285714e-09 | 0 |
| 4.75446428571428e-09 | 0 |
| 4.75669642857142e-09 | 0 |
| 4.75892857142857e-09 | 0 |
| 4.76116071428571e-09 | 0 |
| 4.76339285714285e-09 | 0 |
| 4.76562499999999e-09 | 0 |
| 4.76785714285714e-09 | 0 |
| 4.77008928571428e-09 | 0 |
| 4.77232142857142e-09 | 0 |
| 4.77455357142857e-09 | 0 |
| 4.77678571428571e-09 | 0 |
| 4.77901785714285e-09 | 0 |
| 4.78125e-09 | 0 |
| 4.78348214285714e-09 | 0 |
| 4.78571428571428e-09 | 0 |
| 4.78794642857142e-09 | 0 |
| 4.79017857142857e-09 | 0 |
| 4.79241071428571e-09 | 0 |
| 4.79464285714285e-09 | 0 |
| 4.79687499999999e-09 | 0 |
| 4.79910714285714e-09 | 0 |
| 4.80133928571428e-09 | 0 |
| 4.80357142857142e-09 | 0 |
| 4.80580357142857e-09 | 0 |
| 4.80803571428571e-09 | 0 |
| 4.81026785714285e-09 | 0 |
| 4.8125e-09 | 0 |
| 4.81473214285714e-09 | 0 |
| 4.81696428571428e-09 | 0 |
| 4.81919642857142e-09 | 0 |
| 4.82142857142857e-09 | 0 |
| 4.82366071428571e-09 | 0 |
| 4.82589285714285e-09 | 0 |
| 4.82812499999999e-09 | 0 |
| 4.83035714285714e-09 | 0 |
| 4.83258928571428e-09 | 0 |
| 4.83482142857142e-09 | 0 |
| 4.83705357142857e-09 | 0 |
| 4.83928571428571e-09 | 0 |
| 4.84151785714285e-09 | 0 |
| 4.84374999999999e-09 | 0 |
| 4.84598214285714e-09 | 0 |
| 4.84821428571428e-09 | 0 |
| 4.85044642857142e-09 | 0 |
| 4.85267857142857e-09 | 0 |
| 4.85491071428571e-09 | 0 |
| 4.85714285714285e-09 | 0 |
| 4.859375e-09 | 0 |
| 4.86160714285714e-09 | 0 |
| 4.86383928571428e-09 | 0 |
| 4.86607142857142e-09 | 0 |
| 4.86830357142857e-09 | 0 |
| 4.87053571428571e-09 | 0 |
| 4.87276785714285e-09 | 0 |
| 4.87499999999999e-09 | 0 |
| 4.87723214285714e-09 | 0 |
| 4.87946428571428e-09 | 0 |
| 4.88169642857142e-09 | 0 |
| 4.88392857142857e-09 | 0 |
| 4.88616071428571e-09 | 0 |
| 4.88839285714285e-09 | 0 |
| 4.890625e-09 | 0 |
| 4.89285714285714e-09 | 0.001 |
| 4.89508928571428e-09 | 0.001 |
| 4.89732142857142e-09 | 0.001 |
| 4.89955357142857e-09 | 0.001 |
| 4.90178571428571e-09 | 0.001 |
| 4.90401785714285e-09 | 0.001 |
| 4.90624999999999e-09 | 0.001 |
| 4.90848214285714e-09 | 0.001 |
| 4.91071428571428e-09 | 0.001 |
| 4.91294642857142e-09 | 0.001 |
| 4.91517857142857e-09 | 0.001 |
| 4.91741071428571e-09 | 0.001 |
| 4.91964285714285e-09 | 0.001 |
| 4.921875e-09 | 0.001 |
| 4.92410714285714e-09 | 0.001 |
| 4.92633928571428e-09 | 0.001 |
| 4.92857142857142e-09 | 0.001 |
| 4.93080357142857e-09 | 0.001 |
| 4.93303571428571e-09 | 0.001 |
| 4.93526785714285e-09 | 0.001 |
| 4.93749999999999e-09 | 0.001 |
| 4.93973214285714e-09 | 0.001 |
| 4.94196428571428e-09 | 0.001 |
| 4.94419642857142e-09 | 0.001 |
| 4.94642857142857e-09 | 0.001 |
| 4.94866071428571e-09 | 0.001 |
| 4.95089285714285e-09 | 0.001 |
| 4.95312499999999e-09 | 0.001 |
| 4.95535714285714e-09 | 0.001 |
| 4.95758928571428e-09 | 0.001 |
| 4.95982142857142e-09 | 0.001 |
| 4.96205357142857e-09 | 0.001 |
| 4.96428571428571e-09 | 0 |
| 4.96651785714285e-09 | 0 |
| 4.96875e-09 | 0 |
| 4.97098214285714e-09 | 0 |
| 4.97321428571428e-09 | 0 |
| 4.97544642857142e-09 | 0 |
| 4.97767857142857e-09 | 0 |
| 4.97991071428571e-09 | 0 |
| 4.98214285714285e-09 | 0 |
| 4.98437499999999e-09 | 0 |
| 4.98660714285714e-09 | 0 |
| 4.98883928571428e-09 | 0 |
| 4.99107142857142e-09 | 0 |
| 4.99330357142857e-09 | 0 |
| 4.99553571428571e-09 | 0 |
| 4.99776785714285e-09 | 0 |
| 5e-09 | 0.001 |
| 5.00223214285714e-09 | 0.001 |
| 5.00446428571428e-09 | 0.001 |
| 5.00669642857142e-09 | 0.001 |
| 5.00892857142857e-09 | 0.001 |
| 5.01116071428571e-09 | 0.001 |
| 5.01339285714285e-09 | 0.001 |
| 5.01562499999999e-09 | 0.001 |
| 5.01785714285714e-09 | 0.001 |
| 5.02008928571428e-09 | 0.001 |
| 5.02232142857142e-09 | 0.001 |
| 5.02455357142857e-09 | 0.001 |
| 5.02678571428571e-09 | 0.001 |
| 5.02901785714285e-09 | 0.001 |
| 5.03125e-09 | 0.001 |
| 5.03348214285714e-09 | 0.001 |
| 5.03571428571428e-09 | 0.001 |
| 5.03794642857142e-09 | 0.001 |
| 5.04017857142857e-09 | 0.001 |
| 5.04241071428571e-09 | 0.001 |
| 5.04464285714285e-09 | 0.001 |
| 5.046875e-09 | 0.001 |
| 5.04910714285714e-09 | 0.001 |
| 5.05133928571428e-09 | 0.001 |
| 5.05357142857142e-09 | 0.001 |
| 5.05580357142857e-09 | 0.001 |
| 5.05803571428571e-09 | 0.001 |
| 5.06026785714285e-09 | 0.001 |
| 5.06249999999999e-09 | 0.001 |
| 5.06473214285714e-09 | 0.001 |
| 5.06696428571428e-09 | 0.001 |
| 5.06919642857142e-09 | 0.001 |
| 5.07142857142857e-09 | 0 |
| 5.07366071428571e-09 | 0 |
| 5.07589285714285e-09 | 0 |
| 5.078125e-09 | 0 |
| 5.08035714285714e-09 | 0 |
| 5.08258928571428e-09 | 0 |
| 5.08482142857142e-09 | 0 |
| 5.08705357142857e-09 | 0 |
| 5.08928571428571e-09 | 0 |
| 5.09151785714285e-09 | 0 |
| 5.09374999999999e-09 | 0 |
| 5.09598214285714e-09 | 0 |
| 5.09821428571428e-09 | 0 |
| 5.10044642857142e-09 | 0 |
| 5.10267857142857e-09 | 0 |
| 5.10491071428571e-09 | 0 |
| 5.10714285714285e-09 | 0.001 |
| 5.109375e-09 | 0.001 |
| 5.11160714285714e-09 | 0.001 |
| 5.11383928571428e-09 | 0.001 |
| 5.11607142857142e-09 | 0.001 |
| 5.11830357142857e-09 | 0.001 |
| 5.12053571428571e-09 | 0.001 |
| 5.12276785714285e-09 | 0.001 |
| 5.12499999999999e-09 | 0.001 |
| 5.12723214285714e-09 | 0.001 |
| 5.12946428571428e-09 | 0.001 |
| 5.13169642857142e-09 | 0.001 |
| 5.13392857142857e-09 | 0.001 |
| 5.13616071428571e-09 | 0.001 |
| 5.13839285714285e-09 | 0.001 |
| 5.14062499999999e-09 | 0.001 |
| 5.14285714285714e-09 | 0 |
| 5.14508928571428e-09 | 0 |
| 5.14732142857142e-09 | 0 |
| 5.14955357142857e-09 | 0 |
| 5.15178571428571e-09 | 0 |
| 5.15401785714285e-09 | 0 |
| 5.15625e-09 | 0 |
| 5.15848214285714e-09 | 0 |
| 5.16071428571428e-09 | 0 |
| 5.16294642857142e-09 | 0 |
| 5.16517857142857e-09 | 0 |
| 5.16741071428571e-09 | 0 |
| 5.16964285714285e-09 | 0 |
| 5.17187499999999e-09 | 0 |
| 5.17410714285714e-09 | 0 |
| 5.17633928571428e-09 | 0 |
| 5.17857142857142e-09 | 0 |
| 5.18080357142857e-09 | 0 |
| 5.18303571428571e-09 | 0 |
| 5.18526785714285e-09 | 0 |
| 5.1875e-09 | 0 |
| 5.18973214285714e-09 | 0 |
| 5.19196428571428e-09 | 0 |
| 5.19419642857142e-09 | 0 |
| 5.19642857142857e-09 | 0 |
| 5.19866071428571e-09 | 0 |
| 5.20089285714285e-09 | 0 |
| 5.20312499999999e-09 | 0 |
| 5.20535714285714e-09 | 0 |
| 5.20758928571428e-09 | 0 |
| 5.20982142857142e-09 | 0 |
| 5.21205357142857e-09 | 0 |
| 5.21428571428571e-09 | 0.001 |
| 5.21651785714285e-09 | 0.001 |
| 5.21875e-09 | 0.001 |
| 5.22098214285714e-09 | 0.001 |
| 5.22321428571428e-09 | 0.001 |
| 5.22544642857142e-09 | 0.001 |
| 5.22767857142857e-09 | 0.001 |
| 5.22991071428571e-09 | 0.001 |
| 5.23214285714285e-09 | 0.001 |
| 5.23437499999999e-09 | 0.001 |
| 5.23660714285714e-09 | 0.001 |
| 5.23883928571428e-09 | 0.001 |
| 5.24107142857142e-09 | 0.001 |
| 5.24330357142857e-09 | 0.001 |
| 5.24553571428571e-09 | 0.001 |
| 5.24776785714285e-09 | 0.001 |
| 5.24999999999999e-09 | 0.001 |
| 5.25223214285714e-09 | 0.001 |
| 5.25446428571428e-09 | 0.001 |
| 5.25669642857142e-09 | 0.001 |
| 5.25892857142857e-09 | 0.001 |
| 5.26116071428571e-09 | 0.001 |
| 5.26339285714285e-09 | 0.001 |
| 5.265625e-09 | 0.001 |
| 5.26785714285714e-09 | 0.001 |
| 5.27008928571428e-09 | 0.001 |
| 5.27232142857142e-09 | 0.001 |
| 5.27455357142857e-09 | 0.001 |
| 5.27678571428571e-09 | 0.001 |
| 5.27901785714285e-09 | 0.001 |
| 5.28124999999999e-09 | 0.001 |
| 5.28348214285714e-09 | 0.001 |
| 5.28571428571428e-09 | 0.001 |
| 5.28794642857142e-09 | 0.001 |
| 5.29017857142857e-09 | 0.001 |
| 5.29241071428571e-09 | 0.001 |
| 5.29464285714285e-09 | 0.001 |
| 5.296875e-09 | 0.001 |
| 5.29910714285714e-09 | 0.001 |
| 5.30133928571428e-09 | 0.001 |
| 5.30357142857142e-09 | 0.001 |
| 5.30580357142857e-09 | 0.001 |
| 5.30803571428571e-09 | 0.001 |
| 5.31026785714285e-09 | 0.001 |
| 5.31249999999999e-09 | 0.001 |
| 5.31473214285714e-09 | 0.001 |
| 5.31696428571428e-09 | 0.001 |
| 5.31919642857142e-09 | 0.001 |
| 5.32142857142857e-09 | 0.001 |
| 5.32366071428571e-09 | 0.001 |
| 5.32589285714285e-09 | 0.001 |
| 5.32812499999999e-09 | 0.001 |
| 5.33035714285714e-09 | 0.001 |
| 5.33258928571428e-09 | 0.001 |
| 5.33482142857142e-09 | 0.001 |
| 5.33705357142857e-09 | 0.001 |
| 5.33928571428571e-09 | 0.001 |
| 5.34151785714285e-09 | 0.001 |
| 5.34375e-09 | 0.001 |
| 5.34598214285714e-09 | 0.001 |
| 5.34821428571428e-09 | 0.001 |
| 5.35044642857142e-09 | 0.001 |
| 5.35267857142857e-09 | 0.001 |
| 5.35491071428571e-09 | 0.001 |
| 5.35714285714285e-09 | 0.001 |
| 5.35937499999999e-09 | 0.001 |
| 5.36160714285714e-09 | 0.001 |
| 5.36383928571428e-09 | 0.001 |
| 5.36607142857142e-09 | 0.001 |
| 5.36830357142857e-09 | 0.001 |
| 5.37053571428571e-09 | 0.001 |
| 5.37276785714285e-09 | 0.001 |
| 5.375e-09 | 0.001 |
| 5.37723214285714e-09 | 0.001 |
| 5.37946428571428e-09 | 0.001 |
| 5.38169642857142e-09 | 0.001 |
| 5.38392857142857e-09 | 0.001 |
| 5.38616071428571e-09 | 0.001 |
| 5.38839285714285e-09 | 0.001 |
| 5.39062499999999e-09 | 0.001 |
| 5.39285714285714e-09 | 0 |
| 5.39508928571428e-09 | 0 |
| 5.39732142857142e-09 | 0 |
| 5.39955357142857e-09 | 0 |
| 5.40178571428571e-09 | 0 |
| 5.40401785714285e-09 | 0 |
| 5.40625e-09 | 0 |
| 5.40848214285714e-09 | 0 |
| 5.41071428571428e-09 | 0 |
| 5.41294642857142e-09 | 0 |
| 5.41517857142857e-09 | 0 |
| 5.41741071428571e-09 | 0 |
| 5.41964285714285e-09 | 0 |
| 5.42187499999999e-09 | 0 |
| 5.42410714285714e-09 | 0 |
| 5.42633928571428e-09 | 0 |
| 5.42857142857142e-09 | 0.001 |
| 5.43080357142857e-09 | 0.001 |
| 5.43303571428571e-09 | 0.001 |
| 5.43526785714285e-09 | 0.001 |
| 5.43749999999999e-09 | 0.001 |
| 5.43973214285714e-09 | 0.001 |
| 5.44196428571428e-09 | 0.001 |
| 5.44419642857142e-09 | 0.001 |
| 5.44642857142857e-09 | 0.001 |
| 5.44866071428571e-09 | 0.001 |
| 5.45089285714285e-09 | 0.001 |
| 5.453125e-09 | 0.001 |
| 5.45535714285714e-09 | 0.001 |
| 5.45758928571428e-09 | 0.001 |
| 5.45982142857142e-09 | 0.001 |
| 5.46205357142857e-09 | 0.001 |
| 5.46428571428571e-09 | 0.001 |
| 5.46651785714285e-09 | 0.001 |
| 5.46874999999999e-09 | 0.001 |
| 5.47098214285714e-09 | 0.001 |
| 5.47321428571428e-09 | 0.001 |
| 5.47544642857142e-09 | 0.001 |
| 5.47767857142857e-09 | 0.001 |
| 5.47991071428571e-09 | 0.001 |
| 5.48214285714285e-09 | 0.001 |
| 5.484375e-09 | 0.001 |
| 5.48660714285714e-09 | 0.001 |
| 5.48883928571428e-09 | 0.001 |
| 5.49107142857142e-09 | 0.001 |
| 5.49330357142857e-09 | 0.001 |
| 5.49553571428571e-09 | 0.001 |
| 5.49776785714285e-09 | 0.001 |
| 5.49999999999999e-09 | 0 |
| 5.50223214285714e-09 | 0 |
| 5.50446428571428e-09 | 0 |
| 5.50669642857142e-09 | 0 |
| 5.50892857142857e-09 | 0 |
| 5.51116071428571e-09 | 0 |
| 5.51339285714285e-09 | 0 |
| 5.515625e-09 | 0 |
| 5.51785714285714e-09 | 0 |
| 5.52008928571428e-09 | 0 |
| 5.52232142857142e-09 | 0 |
| 5.52455357142857e-09 | 0 |
| 5.52678571428571e-09 | 0 |
| 5.52901785714285e-09 | 0 |
| 5.53125e-09 | 0 |
| 5.53348214285714e-09 | 0 |
| 5.53571428571428e-09 | 0 |
| 5.53794642857142e-09 | 0 |
| 5.54017857142857e-09 | 0 |
| 5.54241071428571e-09 | 0 |
| 5.54464285714285e-09 | 0 |
| 5.54687499999999e-09 | 0 |
| 5.54910714285714e-09 | 0 |
| 5.55133928571428e-09 | 0 |
| 5.55357142857142e-09 | 0 |
| 5.55580357142857e-09 | 0 |
| 5.55803571428571e-09 | 0 |
| 5.56026785714285e-09 | 0 |
| 5.5625e-09 | 0 |
| 5.56473214285714e-09 | 0 |
| 5.56696428571428e-09 | 0 |
| 5.56919642857142e-09 | 0 |
| 5.57142857142857e-09 | 0.001 |
| 5.57366071428571e-09 | 0.001 |
| 5.57589285714285e-09 | 0.001 |
| 5.57812499999999e-09 | 0.001 |
| 5.58035714285714e-09 | 0.001 |
| 5.58258928571428e-09 | 0.001 |
| 5.58482142857142e-09 | 0.001 |
| 5.58705357142857e-09 | 0.001 |
| 5.58928571428571e-09 | 0.001 |
| 5.59151785714285e-09 | 0.001 |
| 5.59375e-09 | 0.001 |
| 5.59598214285714e-09 | 0.001 |
| 5.59821428571428e-09 | 0.001 |
| 5.60044642857142e-09 | 0.001 |
| 5.60267857142857e-09 | 0.001 |
| 5.60491071428571e-09 | 0.001 |
| 5.60714285714285e-09 | 0.001 |
| 5.60937499999999e-09 | 0.001 |
| 5.61160714285714e-09 | 0.001 |
| 5.61383928571428e-09 | 0.001 |
| 5.61607142857142e-09 | 0.001 |
| 5.61830357142857e-09 | 0.001 |
| 5.62053571428571e-09 | 0.001 |
| 5.62276785714285e-09 | 0.001 |
| 5.62499999999999e-09 | 0.001 |
| 5.62723214285714e-09 | 0.001 |
| 5.62946428571428e-09 | 0.001 |
| 5.63169642857142e-09 | 0.001 |
| 5.63392857142857e-09 | 0.001 |
| 5.63616071428571e-09 | 0.001 |
| 5.63839285714285e-09 | 0.001 |
| 5.640625e-09 | 0.001 |
| 5.64285714285714e-09 | 0 |
| 5.64508928571428e-09 | 0 |
| 5.64732142857142e-09 | 0 |
| 5.64955357142857e-09 | 0 |
| 5.65178571428571e-09 | 0 |
| 5.65401785714285e-09 | 0 |
| 5.65624999999999e-09 | 0 |
| 5.65848214285714e-09 | 0 |
| 5.66071428571428e-09 | 0 |
| 5.66294642857142e-09 | 0 |
| 5.66517857142857e-09 | 0 |
| 5.66741071428571e-09 | 0 |
| 5.66964285714285e-09 | 0 |
| 5.671875e-09 | 0 |
| 5.67410714285714e-09 | 0 |
| 5.67633928571428e-09 | 0 |
| 5.67857142857142e-09 | 0.001 |
| 5.68080357142857e-09 | 0.001 |
| 5.68303571428571e-09 | 0.001 |
| 5.68526785714285e-09 | 0.001 |
| 5.68749999999999e-09 | 0.001 |
| 5.68973214285714e-09 | 0.001 |
| 5.69196428571428e-09 | 0.001 |
| 5.69419642857142e-09 | 0.001 |
| 5.69642857142857e-09 | 0.001 |
| 5.69866071428571e-09 | 0.001 |
| 5.70089285714285e-09 | 0.001 |
| 5.703125e-09 | 0.001 |
| 5.70535714285714e-09 | 0.001 |
| 5.70758928571428e-09 | 0.001 |
| 5.70982142857142e-09 | 0.001 |
| 5.71205357142857e-09 | 0.001 |
| 5.71428571428571e-09 | 0.001 |
| 5.71651785714285e-09 | 0.001 |
| 5.71874999999999e-09 | 0.001 |
| 5.72098214285714e-09 | 0.001 |
| 5.72321428571428e-09 | 0.001 |
| 5.72544642857142e-09 | 0.001 |
| 5.72767857142857e-09 | 0.001 |
| 5.72991071428571e-09 | 0.001 |
| 5.73214285714285e-09 | 0.001 |
| 5.73437499999999e-09 | 0.001 |
| 5.73660714285714e-09 | 0.001 |
| 5.73883928571428e-09 | 0.001 |
| 5.74107142857142e-09 | 0.001 |
| 5.74330357142857e-09 | 0.001 |
| 5.74553571428571e-09 | 0.001 |
| 5.74776785714285e-09 | 0.001 |
| 5.75e-09 | 0.001 |
| 5.75223214285714e-09 | 0.001 |
| 5.75446428571428e-09 | 0.001 |
| 5.75669642857142e-09 | 0.001 |
| 5.75892857142857e-09 | 0.001 |
| 5.76116071428571e-09 | 0.001 |
| 5.76339285714285e-09 | 0.001 |
| 5.76562499999999e-09 | 0.001 |
| 5.76785714285714e-09 | 0.001 |
| 5.77008928571428e-09 | 0.001 |
| 5.77232142857142e-09 | 0.001 |
| 5.77455357142857e-09 | 0.001 |
| 5.77678571428571e-09 | 0.001 |
| 5.77901785714285e-09 | 0.001 |
| 5.78125e-09 | 0.001 |
| 5.78348214285714e-09 | 0.001 |
| 5.78571428571428e-09 | 0 |
| 5.78794642857142e-09 | 0 |
| 5.79017857142857e-09 | 0 |
| 5.79241071428571e-09 | 0 |
| 5.79464285714285e-09 | 0 |
| 5.79687499999999e-09 | 0 |
| 5.79910714285714e-09 | 0 |
| 5.80133928571428e-09 | 0 |
| 5.80357142857142e-09 | 0 |
| 5.80580357142857e-09 | 0 |
| 5.80803571428571e-09 | 0 |
| 5.81026785714285e-09 | 0 |
| 5.81249999999999e-09 | 0 |
| 5.81473214285714e-09 | 0 |
| 5.81696428571428e-09 | 0 |
| 5.81919642857142e-09 | 0 |
| 5.82142857142857e-09 | 0.001 |
| 5.82366071428571e-09 | 0.001 |
| 5.82589285714285e-09 | 0.001 |
| 5.828125e-09 | 0.001 |
| 5.83035714285714e-09 | 0.001 |
| 5.83258928571428e-09 | 0.001 |
| 5.83482142857142e-09 | 0.001 |
| 5.83705357142857e-09 | 0.001 |
| 5.83928571428571e-09 | 0.001 |
| 5.84151785714285e-09 | 0.001 |
| 5.84374999999999e-09 | 0.001 |
| 5.84598214285714e-09 | 0.001 |
| 5.84821428571428e-09 | 0.001 |
| 5.85044642857142e-09 | 0.001 |
| 5.85267857142857e-09 | 0.001 |
| 5.85491071428571e-09 | 0.001 |
| 5.85714285714285e-09 | 0 |
| 5.859375e-09 | 0 |
| 5.86160714285714e-09 | 0 |
| 5.86383928571428e-09 | 0 |
| 5.86607142857142e-09 | 0 |
| 5.86830357142857e-09 | 0 |
| 5.87053571428571e-09 | 0 |
| 5.87276785714285e-09 | 0 |
| 5.87499999999999e-09 | 0 |
| 5.87723214285714e-09 | 0 |
| 5.87946428571428e-09 | 0 |
| 5.88169642857142e-09 | 0 |
| 5.88392857142857e-09 | 0 |
| 5.88616071428571e-09 | 0 |
| 5.88839285714285e-09 | 0 |
| 5.890625e-09 | 0 |
| 5.89285714285714e-09 | 0.001 |
| 5.89508928571428e-09 | 0.001 |
| 5.89732142857142e-09 | 0.001 |
| 5.89955357142857e-09 | 0.001 |
| 5.90178571428571e-09 | 0.001 |
| 5.90401785714285e-09 | 0.001 |
| 5.90624999999999e-09 | 0.001 |
| 5.90848214285714e-09 | 0.001 |
| 5.91071428571428e-09 | 0.001 |
| 5.91294642857142e-09 | 0.001 |
| 5.91517857142857e-09 | 0.001 |
| 5.91741071428571e-09 | 0.001 |
| 5.91964285714285e-09 | 0.001 |
| 5.92187499999999e-09 | 0.001 |
| 5.92410714285714e-09 | 0.001 |
| 5.92633928571428e-09 | 0.001 |
| 5.92857142857142e-09 | 0.001 |
| 5.93080357142857e-09 | 0.001 |
| 5.93303571428571e-09 | 0.001 |
| 5.93526785714285e-09 | 0.001 |
| 5.9375e-09 | 0.001 |
| 5.93973214285714e-09 | 0.001 |
| 5.94196428571428e-09 | 0.001 |
| 5.94419642857142e-09 | 0.001 |
| 5.94642857142857e-09 | 0.001 |
| 5.94866071428571e-09 | 0.001 |
| 5.95089285714285e-09 | 0.001 |
| 5.95312499999999e-09 | 0.001 |
| 5.95535714285714e-09 | 0.001 |
| 5.95758928571428e-09 | 0.001 |
| 5.95982142857142e-09 | 0.001 |
| 5.96205357142857e-09 | 0.001 |
| 5.96428571428571e-09 | 0.001 |
| 5.96651785714285e-09 | 0.001 |
| 5.96875e-09 | 0.001 |
| 5.97098214285714e-09 | 0.001 |
| 5.97321428571428e-09 | 0.001 |
| 5.97544642857142e-09 | 0.001 |
| 5.97767857142857e-09 | 0.001 |
| 5.97991071428571e-09 | 0.001 |
| 5.98214285714285e-09 | 0.001 |
| 5.98437499999999e-09 | 0.001 |
| 5.98660714285714e-09 | 0.001 |
| 5.98883928571428e-09 | 0.001 |
| 5.99107142857142e-09 | 0.001 |
| 5.99330357142857e-09 | 0.001 |
| 5.99553571428571e-09 | 0.001 |
| 5.99776785714285e-09 | 0.001 |
| 6e-09 | 0 |
| 6.00223214285714e-09 | 0 |
| 6.00446428571428e-09 | 0 |
| 6.00669642857142e-09 | 0 |
| 6.00892857142857e-09 | 0 |
| 6.01116071428571e-09 | 0 |
| 6.01339285714285e-09 | 0 |
| 6.015625e-09 | 0 |
| 6.01785714285714e-09 | 0 |
| 6.02008928571428e-09 | 0 |
| 6.02232142857142e-09 | 0 |
| 6.02455357142857e-09 | 0 |
| 6.02678571428571e-09 | 0 |
| 6.02901785714285e-09 | 0 |
| 6.03124999999999e-09 | 0 |
| 6.03348214285714e-09 | 0 |
| 6.03571428571428e-09 | 0 |
| 6.03794642857142e-09 | 0 |
| 6.04017857142857e-09 | 0 |
| 6.04241071428571e-09 | 0 |
| 6.04464285714285e-09 | 0 |
| 6.046875e-09 | 0 |
| 6.04910714285714e-09 | 0 |
| 6.05133928571428e-09 | 0 |
| 6.05357142857142e-09 | 0 |
| 6.05580357142857e-09 | 0 |
| 6.05803571428571e-09 | 0 |
| 6.06026785714285e-09 | 0 |
| 6.06249999999999e-09 | 0 |
| 6.06473214285714e-09 | 0 |
| 6.06696428571428e-09 | 0 |
| 6.06919642857142e-09 | 0 |
| 6.07142857142857e-09 | 0.001 |
| 6.07366071428571e-09 | 0.001 |
| 6.07589285714285e-09 | 0.001 |
| 6.078125e-09 | 0.001 |
| 6.08035714285714e-09 | 0.001 |
| 6.08258928571428e-09 | 0.001 |
| 6.08482142857142e-09 | 0.001 |
| 6.08705357142857e-09 | 0.001 |
| 6.08928571428571e-09 | 0.001 |
| 6.09151785714285e-09 | 0.001 |
| 6.09374999999999e-09 | 0.001 |
| 6.09598214285714e-09 | 0.001 |
| 6.09821428571428e-09 | 0.001 |
| 6.10044642857142e-09 | 0.001 |
| 6.10267857142857e-09 | 0.001 |
| 6.10491071428571e-09 | 0.001 |
| 6.10714285714285e-09 | 0 |
| 6.10937499999999e-09 | 0 |
| 6.11160714285714e-09 | 0 |
| 6.11383928571428e-09 | 0 |
| 6.11607142857142e-09 | 0 |
| 6.11830357142857e-09 | 0 |
| 6.12053571428571e-09 | 0 |
| 6.12276785714285e-09 | 0 |
| 6.125e-09 | 0 |
| 6.12723214285714e-09 | 0 |
| 6.12946428571428e-09 | 0 |
| 6.13169642857142e-09 | 0 |
| 6.13392857142857e-09 | 0 |
| 6.13616071428571e-09 | 0 |
| 6.13839285714285e-09 | 0 |
| 6.14062499999999e-09 | 0 |
| 6.14285714285714e-09 | 0 |
| 6.14508928571428e-09 | 0 |
| 6.14732142857142e-09 | 0 |
| 6.14955357142857e-09 | 0 |
| 6.15178571428571e-09 | 0 |
| 6.15401785714285e-09 | 0 |
| 6.15625e-09 | 0 |
| 6.15848214285714e-09 | 0 |
| 6.16071428571428e-09 | 0 |
| 6.16294642857142e-09 | 0 |
| 6.16517857142857e-09 | 0 |
| 6.16741071428571e-09 | 0 |
| 6.16964285714285e-09 | 0 |
| 6.17187499999999e-09 | 0 |
| 6.17410714285714e-09 | 0 |
| 6.17633928571428e-09 | 0 |
| 6.17857142857142e-09 | 0.001 |
| 6.18080357142857e-09 | 0.001 |
| 6.18303571428571e-09 | 0.001 |
| 6.18526785714285e-09 | 0.001 |
| 6.1875e-09 | 0.001 |
| 6.18973214285714e-09 | 0.001 |
| 6.19196428571428e-09 | 0.001 |
| 6.19419642857142e-09 | 0.001 |
| 6.19642857142857e-09 | 0.001 |
| 6.19866071428571e-09 | 0.001 |
| 6.20089285714285e-09 | 0.001 |
| 6.20312499999999e-09 | 0.001 |
| 6.20535714285714e-09 | 0.001 |
| 6.20758928571428e-09 | 0.001 |
| 6.20982142857142e-09 | 0.001 |
| 6.21205357142857e-09 | 0.001 |
| 6.21428571428571e-09 | 0 |
| 6.21651785714285e-09 | 0 |
| 6.21874999999999e-09 | 0 |
| 6.22098214285714e-09 | 0 |
| 6.22321428571428e-09 | 0 |
| 6.22544642857142e-09 | 0 |
| 6.22767857142857e-09 | 0 |
| 6.22991071428571e-09 | 0 |
| 6.23214285714285e-09 | 0 |
| 6.234375e-09 | 0 |
| 6.23660714285714e-09 | 0 |
| 6.23883928571428e-09 | 0 |
| 6.24107142857142e-09 | 0 |
| 6.24330357142857e-09 | 0 |
| 6.24553571428571e-09 | 0 |
| 6.24776785714285e-09 | 0 |
| 6.24999999999999e-09 | 0 |
| 6.25223214285714e-09 | 0 |
| 6.25446428571428e-09 | 0 |
| 6.25669642857142e-09 | 0 |
| 6.25892857142857e-09 | 0 |
| 6.26116071428571e-09 | 0 |
| 6.26339285714285e-09 | 0 |
| 6.265625e-09 | 0 |
| 6.26785714285714e-09 | 0 |
| 6.27008928571428e-09 | 0 |
| 6.27232142857142e-09 | 0 |
| 6.27455357142857e-09 | 0 |
| 6.27678571428571e-09 | 0 |
| 6.27901785714285e-09 | 0 |
| 6.28124999999999e-09 | 0 |
| 6.28348214285714e-09 | 0 |
| 6.28571428571428e-09 | 0 |
| 6.28794642857142e-09 | 0 |
| 6.29017857142857e-09 | 0 |
| 6.29241071428571e-09 | 0 |
| 6.29464285714285e-09 | 0 |
| 6.29687499999999e-09 | 0 |
| 6.29910714285714e-09 | 0 |
| 6.30133928571428e-09 | 0 |
| 6.30357142857142e-09 | 0 |
| 6.30580357142857e-09 | 0 |
| 6.30803571428571e-09 | 0 |
| 6.31026785714285e-09 | 0 |
| 6.3125e-09 | 0 |
| 6.31473214285714e-09 | 0 |
| 6.31696428571428e-09 | 0 |
| 6.31919642857142e-09 | 0 |
| 6.32142857142857e-09 | 0.001 |
| 6.32366071428571e-09 | 0.001 |
| 6.32589285714285e-09 | 0.001 |
| 6.32812499999999e-09 | 0.001 |
| 6.33035714285714e-09 | 0.001 |
| 6.33258928571428e-09 | 0.001 |
| 6.33482142857142e-09 | 0.001 |
| 6.33705357142857e-09 | 0.001 |
| 6.33928571428571e-09 | 0.001 |
| 6.34151785714285e-09 | 0.001 |
| 6.34375e-09 | 0.001 |
| 6.34598214285714e-09 | 0.001 |
| 6.34821428571428e-09 | 0.001 |
| 6.35044642857142e-09 | 0.001 |
| 6.35267857142857e-09 | 0.001 |
| 6.35491071428571e-09 | 0.001 |
| 6.35714285714285e-09 | 0.001 |
| 6.35937499999999e-09 | 0.001 |
| 6.36160714285714e-09 | 0.001 |
| 6.36383928571428e-09 | 0.001 |
| 6.36607142857142e-09 | 0.001 |
| 6.36830357142857e-09 | 0.001 |
| 6.37053571428571e-09 | 0.001 |
| 6.37276785714285e-09 | 0.001 |
| 6.375e-09 | 0.001 |
| 6.37723214285714e-09 | 0.001 |
| 6.37946428571428e-09 | 0.001 |
| 6.38169642857142e-09 | 0.001 |
| 6.38392857142857e-09 | 0.001 |
| 6.38616071428571e-09 | 0.001 |
| 6.38839285714285e-09 | 0.001 |
| 6.39062499999999e-09 | 0.001 |
| 6.39285714285714e-09 | 0.001 |
| 6.39508928571428e-09 | 0.001 |
| 6.39732142857142e-09 | 0.001 |
| 6.39955357142857e-09 | 0.001 |
| 6.40178571428571e-09 | 0.001 |
| 6.40401785714285e-09 | 0.001 |
| 6.40624999999999e-09 | 0.001 |
| 6.40848214285714e-09 | 0.001 |
| 6.41071428571428e-09 | 0.001 |
| 6.41294642857142e-09 | 0.001 |
| 6.41517857142857e-09 | 0.001 |
| 6.41741071428571e-09 | 0.001 |
| 6.41964285714285e-09 | 0.001 |
| 6.421875e-09 | 0.001 |
| 6.42410714285714e-09 | 0.001 |
| 6.42633928571428e-09 | 0.001 |
| 6.42857142857142e-09 | 0.001 |
| 6.43080357142857e-09 | 0.001 |
| 6.43303571428571e-09 | 0.001 |
| 6.43526785714285e-09 | 0.001 |
| 6.43749999999999e-09 | 0.001 |
| 6.43973214285714e-09 | 0.001 |
| 6.44196428571428e-09 | 0.001 |
| 6.44419642857142e-09 | 0.001 |
| 6.44642857142857e-09 | 0.001 |
| 6.44866071428571e-09 | 0.001 |
| 6.45089285714285e-09 | 0.001 |
| 6.453125e-09 | 0.001 |
| 6.45535714285714e-09 | 0.001 |
| 6.45758928571428e-09 | 0.001 |
| 6.45982142857142e-09 | 0.001 |
| 6.46205357142857e-09 | 0.001 |
| 6.46428571428571e-09 | 0.001 |
| 6.46651785714285e-09 | 0.001 |
| 6.46874999999999e-09 | 0.001 |
| 6.47098214285714e-09 | 0.001 |
| 6.47321428571428e-09 | 0.001 |
| 6.47544642857142e-09 | 0.001 |
| 6.47767857142857e-09 | 0.001 |
| 6.47991071428571e-09 | 0.001 |
| 6.48214285714285e-09 | 0.001 |
| 6.484375e-09 | 0.001 |
| 6.48660714285714e-09 | 0.001 |
| 6.48883928571428e-09 | 0.001 |
| 6.49107142857142e-09 | 0.001 |
| 6.49330357142857e-09 | 0.001 |
| 6.49553571428571e-09 | 0.001 |
| 6.49776785714285e-09 | 0.001 |
| 6.5e-09 | 0.001 |
| 6.50223214285714e-09 | 0.001 |
| 6.50446428571428e-09 | 0.001 |
| 6.50669642857142e-09 | 0.001 |
| 6.50892857142857e-09 | 0.001 |
| 6.51116071428571e-09 | 0.001 |
| 6.51339285714285e-09 | 0.001 |
| 6.51562499999999e-09 | 0.001 |
| 6.51785714285714e-09 | 0.001 |
| 6.52008928571428e-09 | 0.001 |
| 6.52232142857142e-09 | 0.001 |
| 6.52455357142857e-09 | 0.001 |
| 6.52678571428571e-09 | 0.001 |
| 6.52901785714285e-09 | 0.001 |
| 6.53125e-09 | 0.001 |
| 6.53348214285714e-09 | 0.001 |
| 6.53571428571428e-09 | 0 |
| 6.53794642857142e-09 | 0 |
| 6.54017857142857e-09 | 0 |
| 6.54241071428571e-09 | 0 |
| 6.54464285714285e-09 | 0 |
| 6.54687499999999e-09 | 0 |
| 6.54910714285714e-09 | 0 |
| 6.55133928571428e-09 | 0 |
| 6.55357142857142e-09 | 0 |
| 6.55580357142857e-09 | 0 |
| 6.55803571428571e-09 | 0 |
| 6.56026785714285e-09 | 0 |
| 6.5625e-09 | 0 |
| 6.56473214285714e-09 | 0 |
| 6.56696428571428e-09 | 0 |
| 6.56919642857142e-09 | 0 |
| 6.57142857142857e-09 | 0 |
| 6.57366071428571e-09 | 0 |
| 6.57589285714285e-09 | 0 |
| 6.57812499999999e-09 | 0 |
| 6.58035714285714e-09 | 0 |
| 6.58258928571428e-09 | 0 |
| 6.58482142857142e-09 | 0 |
| 6.58705357142857e-09 | 0 |
| 6.58928571428571e-09 | 0 |
| 6.59151785714285e-09 | 0 |
| 6.59374999999999e-09 | 0 |
| 6.59598214285714e-09 | 0 |
| 6.59821428571428e-09 | 0 |
| 6.60044642857142e-09 | 0 |
| 6.60267857142857e-09 | 0 |
| 6.60491071428571e-09 | 0 |
| 6.60714285714285e-09 | 0 |
| 6.609375e-09 | 0 |
| 6.61160714285714e-09 | 0 |
| 6.61383928571428e-09 | 0 |
| 6.61607142857142e-09 | 0 |
| 6.61830357142857e-09 | 0 |
| 6.62053571428571e-09 | 0 |
| 6.62276785714285e-09 | 0 |
| 6.62499999999999e-09 | 0 |
| 6.62723214285714e-09 | 0 |
| 6.62946428571428e-09 | 0 |
| 6.63169642857142e-09 | 0 |
| 6.63392857142857e-09 | 0 |
| 6.63616071428571e-09 | 0 |
| 6.63839285714285e-09 | 0 |
| 6.640625e-09 | 0 |
| 6.64285714285714e-09 | 0 |
| 6.64508928571428e-09 | 0 |
| 6.64732142857142e-09 | 0 |
| 6.64955357142857e-09 | 0 |
| 6.65178571428571e-09 | 0 |
| 6.65401785714285e-09 | 0 |
| 6.65624999999999e-09 | 0 |
| 6.65848214285714e-09 | 0 |
| 6.66071428571428e-09 | 0 |
| 6.66294642857142e-09 | 0 |
| 6.66517857142857e-09 | 0 |
| 6.66741071428571e-09 | 0 |
| 6.66964285714285e-09 | 0 |
| 6.671875e-09 | 0 |
| 6.67410714285714e-09 | 0 |
| 6.67633928571428e-09 | 0 |
| 6.67857142857142e-09 | 0.001 |
| 6.68080357142857e-09 | 0.001 |
| 6.68303571428571e-09 | 0.001 |
| 6.68526785714285e-09 | 0.001 |
| 6.68749999999999e-09 | 0.001 |
| 6.68973214285714e-09 | 0.001 |
| 6.69196428571428e-09 | 0.001 |
| 6.69419642857142e-09 | 0.001 |
| 6.69642857142857e-09 | 0.001 |
| 6.69866071428571e-09 | 0.001 |
| 6.70089285714285e-09 | 0.001 |
| 6.70312499999999e-09 | 0.001 |
| 6.70535714285714e-09 | 0.001 |
| 6.70758928571428e-09 | 0.001 |
| 6.70982142857142e-09 | 0.001 |
| 6.71205357142857e-09 | 0.001 |
| 6.71428571428571e-09 | 0.001 |
| 6.71651785714285e-09 | 0.001 |
| 6.71875e-09 | 0.001 |
| 6.72098214285714e-09 | 0.001 |
| 6.72321428571428e-09 | 0.001 |
| 6.72544642857142e-09 | 0.001 |
| 6.72767857142857e-09 | 0.001 |
| 6.72991071428571e-09 | 0.001 |
| 6.73214285714285e-09 | 0.001 |
| 6.73437499999999e-09 | 0.001 |
| 6.73660714285714e-09 | 0.001 |
| 6.73883928571428e-09 | 0.001 |
| 6.74107142857142e-09 | 0.001 |
| 6.74330357142857e-09 | 0.001 |
| 6.74553571428571e-09 | 0.001 |
| 6.74776785714285e-09 | 0.001 |
| 6.75e-09 | 0.001 |
| 6.75223214285714e-09 | 0.001 |
| 6.75446428571428e-09 | 0.001 |
| 6.75669642857142e-09 | 0.001 |
| 6.75892857142857e-09 | 0.001 |
| 6.76116071428571e-09 | 0.001 |
| 6.76339285714285e-09 | 0.001 |
| 6.76562499999999e-09 | 0.001 |
| 6.76785714285714e-09 | 0.001 |
| 6.77008928571428e-09 | 0.001 |
| 6.77232142857142e-09 | 0.001 |
| 6.77455357142857e-09 | 0.001 |
| 6.77678571428571e-09 | 0.001 |
| 6.77901785714285e-09 | 0.001 |
| 6.78124999999999e-09 | 0.001 |
| 6.78348214285714e-09 | 0.001 |
| 6.78571428571428e-09 | 0 |
| 6.78794642857142e-09 | 0 |
| 6.79017857142857e-09 | 0 |
| 6.79241071428571e-09 | 0 |
| 6.79464285714285e-09 | 0 |
| 6.796875e-09 | 0 |
| 6.79910714285714e-09 | 0 |
| 6.80133928571428e-09 | 0 |
| 6.80357142857142e-09 | 0 |
| 6.80580357142857e-09 | 0 |
| 6.80803571428571e-09 | 0 |
| 6.81026785714285e-09 | 0 |
| 6.81249999999999e-09 | 0 |
| 6.81473214285714e-09 | 0 |
| 6.81696428571428e-09 | 0 |
| 6.81919642857142e-09 | 0 |
| 6.82142857142857e-09 | 0 |
| 6.82366071428571e-09 | 0 |
| 6.82589285714285e-09 | 0 |
| 6.828125e-09 | 0 |
| 6.83035714285714e-09 | 0 |
| 6.83258928571428e-09 | 0 |
| 6.83482142857142e-09 | 0 |
| 6.83705357142857e-09 | 0 |
| 6.83928571428571e-09 | 0 |
| 6.84151785714285e-09 | 0 |
| 6.84374999999999e-09 | 0 |
| 6.84598214285714e-09 | 0 |
| 6.84821428571428e-09 | 0 |
| 6.85044642857142e-09 | 0 |
| 6.85267857142857e-09 | 0 |
| 6.85491071428571e-09 | 0 |
| 6.85714285714285e-09 | 0 |
| 6.859375e-09 | 0 |
| 6.86160714285714e-09 | 0 |
| 6.86383928571428e-09 | 0 |
| 6.86607142857142e-09 | 0 |
| 6.86830357142857e-09 | 0 |
| 6.87053571428571e-09 | 0 |
| 6.87276785714285e-09 | 0 |
| 6.87499999999999e-09 | 0 |
| 6.87723214285714e-09 | 0 |
| 6.87946428571428e-09 | 0 |
| 6.88169642857142e-09 | 0 |
| 6.88392857142857e-09 | 0 |
| 6.88616071428571e-09 | 0 |
| 6.88839285714285e-09 | 0 |
| 6.89062499999999e-09 | 0 |
| 6.89285714285714e-09 | 0.001 |
| 6.89508928571428e-09 | 0.001 |
| 6.89732142857142e-09 | 0.001 |
| 6.89955357142857e-09 | 0.001 |
| 6.90178571428571e-09 | 0.001 |
| 6.90401785714285e-09 | 0.001 |
| 6.90625e-09 | 0.001 |
| 6.90848214285714e-09 | 0.001 |
| 6.91071428571428e-09 | 0.001 |
| 6.91294642857142e-09 | 0.001 |
| 6.91517857142857e-09 | 0.001 |
| 6.91741071428571e-09 | 0.001 |
| 6.91964285714285e-09 | 0.001 |
| 6.92187499999999e-09 | 0.001 |
| 6.92410714285714e-09 | 0.001 |
| 6.92633928571428e-09 | 0.001 |
| 6.92857142857142e-09 | 0 |
| 6.93080357142857e-09 | 0 |
| 6.93303571428571e-09 | 0 |
| 6.93526785714285e-09 | 0 |
| 6.9375e-09 | 0 |
| 6.93973214285714e-09 | 0 |
| 6.94196428571428e-09 | 0 |
| 6.94419642857142e-09 | 0 |
| 6.94642857142857e-09 | 0 |
| 6.94866071428571e-09 | 0 |
| 6.95089285714285e-09 | 0 |
| 6.95312499999999e-09 | 0 |
| 6.95535714285714e-09 | 0 |
| 6.95758928571428e-09 | 0 |
| 6.95982142857142e-09 | 0 |
| 6.96205357142857e-09 | 0 |
| 6.96428571428571e-09 | 0 |
| 6.96651785714285e-09 | 0 |
| 6.96874999999999e-09 | 0 |
| 6.97098214285714e-09 | 0 |
| 6.97321428571428e-09 | 0 |
| 6.97544642857142e-09 | 0 |
| 6.97767857142857e-09 | 0 |
| 6.97991071428571e-09 | 0 |
| 6.98214285714285e-09 | 0 |
| 6.984375e-09 | 0 |
| 6.98660714285714e-09 | 0 |
| 6.98883928571428e-09 | 0 |
| 6.99107142857142e-09 | 0 |
| 6.99330357142857e-09 | 0 |
| 6.99553571428571e-09 | 0 |
| 6.99776785714285e-09 | 0 |
| 6.99999999999999e-09 | 0 |
| 7.00223214285714e-09 | 0 |
| 7.00446428571428e-09 | 0 |
| 7.00669642857142e-09 | 0 |
| 7.00892857142857e-09 | 0 |
| 7.01116071428571e-09 | 0 |
| 7.01339285714285e-09 | 0 |
| 7.015625e-09 | 0 |
| 7.01785714285714e-09 | 0 |
| 7.02008928571428e-09 | 0 |
| 7.02232142857142e-09 | 0 |
| 7.02455357142857e-09 | 0 |
| 7.02678571428571e-09 | 0 |
| 7.02901785714285e-09 | 0 |
| 7.03124999999999e-09 | 0 |
| 7.03348214285714e-09 | 0 |
| 7.03571428571428e-09 | 0 |
| 7.03794642857142e-09 | 0 |
| 7.04017857142857e-09 | 0 |
| 7.04241071428571e-09 | 0 |
| 7.04464285714285e-09 | 0 |
| 7.046875e-09 | 0 |
| 7.04910714285714e-09 | 0 |
| 7.05133928571428e-09 | 0 |
| 7.05357142857142e-09 | 0 |
| 7.05580357142857e-09 | 0 |
| 7.05803571428571e-09 | 0 |
| 7.06026785714285e-09 | 0 |
| 7.06249999999999e-09 | 0 |
| 7.06473214285714e-09 | 0 |
| 7.06696428571428e-09 | 0 |
| 7.06919642857142e-09 | 0 |
| 7.07142857142857e-09 | 0 |
| 7.07366071428571e-09 | 0 |
| 7.07589285714285e-09 | 0 |
| 7.07812499999999e-09 | 0 |
| 7.08035714285714e-09 | 0 |
| 7.08258928571428e-09 | 0 |
| 7.08482142857142e-09 | 0 |
| 7.08705357142857e-09 | 0 |
| 7.08928571428571e-09 | 0 |
| 7.09151785714285e-09 | 0 |
| 7.09375e-09 | 0 |
| 7.09598214285714e-09 | 0 |
| 7.09821428571428e-09 | 0 |
| 7.10044642857142e-09 | 0 |
| 7.10267857142857e-09 | 0 |
| 7.10491071428571e-09 | 0 |
| 7.10714285714285e-09 | 0 |
| 7.10937499999999e-09 | 0 |
| 7.11160714285714e-09 | 0 |
| 7.11383928571428e-09 | 0 |
| 7.11607142857142e-09 | 0 |
| 7.11830357142857e-09 | 0 |
| 7.12053571428571e-09 | 0 |
| 7.12276785714285e-09 | 0 |
| 7.125e-09 | 0 |
| 7.12723214285714e-09 | 0 |
| 7.12946428571428e-09 | 0 |
| 7.13169642857142e-09 | 0 |
| 7.13392857142857e-09 | 0 |
| 7.13616071428571e-09 | 0 |
| 7.13839285714285e-09 | 0 |
| 7.14062499999999e-09 | 0 |
| 7.14285714285714e-09 | 0 |
| 7.14508928571428e-09 | 0 |
| 7.14732142857142e-09 | 0 |
| 7.14955357142857e-09 | 0 |
| 7.15178571428571e-09 | 0 |
| 7.15401785714285e-09 | 0 |
| 7.15625e-09 | 0 |
| 7.15848214285714e-09 | 0 |
| 7.16071428571428e-09 | 0 |
| 7.16294642857142e-09 | 0 |
| 7.16517857142857e-09 | 0 |
| 7.16741071428571e-09 | 0 |
| 7.16964285714285e-09 | 0 |
| 7.17187499999999e-09 | 0 |
| 7.17410714285714e-09 | 0 |
| 7.17633928571428e-09 | 0 |
| 7.17857142857142e-09 | 0.001 |
| 7.18080357142857e-09 | 0.001 |
| 7.18303571428571e-09 | 0.001 |
| 7.18526785714285e-09 | 0.001 |
| 7.18749999999999e-09 | 0.001 |
| 7.18973214285714e-09 | 0.001 |
| 7.19196428571428e-09 | 0.001 |
| 7.19419642857142e-09 | 0.001 |
| 7.19642857142857e-09 | 0.001 |
| 7.19866071428571e-09 | 0.001 |
| 7.20089285714285e-09 | 0.001 |
| 7.203125e-09 | 0.001 |
| 7.20535714285714e-09 | 0.001 |
| 7.20758928571428e-09 | 0.001 |
| 7.20982142857142e-09 | 0.001 |
| 7.21205357142857e-09 | 0.001 |
| 7.21428571428571e-09 | 0.001 |
| 7.21651785714285e-09 | 0.001 |
| 7.21874999999999e-09 | 0.001 |
| 7.22098214285714e-09 | 0.001 |
| 7.22321428571428e-09 | 0.001 |
| 7.22544642857142e-09 | 0.001 |
| 7.22767857142857e-09 | 0.001 |
| 7.22991071428571e-09 | 0.001 |
| 7.23214285714285e-09 | 0.001 |
| 7.234375e-09 | 0.001 |
| 7.23660714285714e-09 | 0.001 |
| 7.23883928571428e-09 | 0.001 |
| 7.24107142857142e-09 | 0.001 |
| 7.24330357142857e-09 | 0.001 |
| 7.24553571428571e-09 | 0.001 |
| 7.24776785714285e-09 | 0.001 |
| 7.24999999999999e-09 | 0 |
| 7.25223214285714e-09 | 0 |
| 7.25446428571428e-09 | 0 |
| 7.25669642857142e-09 | 0 |
| 7.25892857142857e-09 | 0 |
| 7.26116071428571e-09 | 0 |
| 7.26339285714285e-09 | 0 |
| 7.26562499999999e-09 | 0 |
| 7.26785714285714e-09 | 0 |
| 7.27008928571428e-09 | 0 |
| 7.27232142857142e-09 | 0 |
| 7.27455357142857e-09 | 0 |
| 7.27678571428571e-09 | 0 |
| 7.27901785714285e-09 | 0 |
| 7.28125e-09 | 0 |
| 7.28348214285714e-09 | 0 |
| 7.28571428571428e-09 | 0.001 |
| 7.28794642857142e-09 | 0.001 |
| 7.29017857142857e-09 | 0.001 |
| 7.29241071428571e-09 | 0.001 |
| 7.29464285714285e-09 | 0.001 |
| 7.29687499999999e-09 | 0.001 |
| 7.29910714285714e-09 | 0.001 |
| 7.30133928571428e-09 | 0.001 |
| 7.30357142857142e-09 | 0.001 |
| 7.30580357142857e-09 | 0.001 |
| 7.30803571428571e-09 | 0.001 |
| 7.31026785714285e-09 | 0.001 |
| 7.3125e-09 | 0.001 |
| 7.31473214285714e-09 | 0.001 |
| 7.31696428571428e-09 | 0.001 |
| 7.31919642857142e-09 | 0.001 |
| 7.32142857142857e-09 | 0.001 |
| 7.32366071428571e-09 | 0.001 |
| 7.32589285714285e-09 | 0.001 |
| 7.32812499999999e-09 | 0.001 |
| 7.33035714285714e-09 | 0.001 |
| 7.33258928571428e-09 | 0.001 |
| 7.33482142857142e-09 | 0.001 |
| 7.33705357142857e-09 | 0.001 |
| 7.33928571428571e-09 | 0.001 |
| 7.34151785714285e-09 | 0.001 |
| 7.34375e-09 | 0.001 |
| 7.34598214285714e-09 | 0.001 |
| 7.34821428571428e-09 | 0.001 |
| 7.35044642857142e-09 | 0.001 |
| 7.35267857142857e-09 | 0.001 |
| 7.35491071428571e-09 | 0.001 |
| 7.35714285714285e-09 | 0.001 |
| 7.35937499999999e-09 | 0.001 |
| 7.36160714285714e-09 | 0.001 |
| 7.36383928571428e-09 | 0.001 |
| 7.36607142857142e-09 | 0.001 |
| 7.36830357142857e-09 | 0.001 |
| 7.37053571428571e-09 | 0.001 |
| 7.37276785714285e-09 | 0.001 |
| 7.37499999999999e-09 | 0.001 |
| 7.37723214285714e-09 | 0.001 |
| 7.37946428571428e-09 | 0.001 |
| 7.38169642857142e-09 | 0.001 |
| 7.38392857142857e-09 | 0.001 |
| 7.38616071428571e-09 | 0.001 |
| 7.38839285714285e-09 | 0.001 |
| 7.390625e-09 | 0.001 |
| 7.39285714285714e-09 | 0.001 |
| 7.39508928571428e-09 | 0.001 |
| 7.39732142857142e-09 | 0.001 |
| 7.39955357142857e-09 | 0.001 |
| 7.40178571428571e-09 | 0.001 |
| 7.40401785714285e-09 | 0.001 |
| 7.40624999999999e-09 | 0.001 |
| 7.40848214285714e-09 | 0.001 |
| 7.41071428571428e-09 | 0.001 |
| 7.41294642857142e-09 | 0.001 |
| 7.41517857142857e-09 | 0.001 |
| 7.41741071428571e-09 | 0.001 |
| 7.41964285714285e-09 | 0.001 |
| 7.421875e-09 | 0.001 |
| 7.42410714285714e-09 | 0.001 |
| 7.42633928571428e-09 | 0.001 |
| 7.42857142857142e-09 | 0 |
| 7.43080357142857e-09 | 0 |
| 7.43303571428571e-09 | 0 |
| 7.43526785714285e-09 | 0 |
| 7.43749999999999e-09 | 0 |
| 7.43973214285714e-09 | 0 |
| 7.44196428571428e-09 | 0 |
| 7.44419642857142e-09 | 0 |
| 7.44642857142857e-09 | 0 |
| 7.44866071428571e-09 | 0 |
| 7.45089285714285e-09 | 0 |
| 7.45312499999999e-09 | 0 |
| 7.45535714285714e-09 | 0 |
| 7.45758928571428e-09 | 0 |
| 7.45982142857142e-09 | 0 |
| 7.46205357142857e-09 | 0 |
| 7.46428571428571e-09 | 0 |
| 7.46651785714285e-09 | 0 |
| 7.46875e-09 | 0 |
| 7.47098214285714e-09 | 0 |
| 7.47321428571428e-09 | 0 |
| 7.47544642857142e-09 | 0 |
| 7.47767857142857e-09 | 0 |
| 7.47991071428571e-09 | 0 |
| 7.48214285714285e-09 | 0 |
| 7.48437499999999e-09 | 0 |
| 7.48660714285714e-09 | 0 |
| 7.48883928571428e-09 | 0 |
| 7.49107142857142e-09 | 0 |
| 7.49330357142857e-09 | 0 |
| 7.49553571428571e-09 | 0 |
| 7.49776785714285e-09 | 0 |
| 7.49999999999999e-09 | 0.001 |
| 7.50223214285714e-09 | 0.001 |
| 7.50446428571428e-09 | 0.001 |
| 7.50669642857142e-09 | 0.001 |
| 7.50892857142857e-09 | 0.001 |
| 7.51116071428571e-09 | 0.001 |
| 7.51339285714285e-09 | 0.001 |
| 7.515625e-09 | 0.001 |
| 7.51785714285714e-09 | 0.001 |
| 7.52008928571428e-09 | 0.001 |
| 7.52232142857142e-09 | 0.001 |
| 7.52455357142857e-09 | 0.001 |
| 7.52678571428571e-09 | 0.001 |
| 7.52901785714285e-09 | 0.001 |
| 7.53125e-09 | 0.001 |
| 7.53348214285714e-09 | 0.001 |
| 7.53571428571428e-09 | 0.001 |
| 7.53794642857142e-09 | 0.001 |
| 7.54017857142857e-09 | 0.001 |
| 7.54241071428571e-09 | 0.001 |
| 7.54464285714285e-09 | 0.001 |
| 7.54687499999999e-09 | 0.001 |
| 7.54910714285714e-09 | 0.001 |
| 7.55133928571428e-09 | 0.001 |
| 7.55357142857142e-09 | 0.001 |
| 7.55580357142857e-09 | 0.001 |
| 7.55803571428571e-09 | 0.001 |
| 7.56026785714285e-09 | 0.001 |
| 7.56249999999999e-09 | 0.001 |
| 7.56473214285714e-09 | 0.001 |
| 7.56696428571428e-09 | 0.001 |
| 7.56919642857142e-09 | 0.001 |
| 7.57142857142857e-09 | 0.001 |
| 7.57366071428571e-09 | 0.001 |
| 7.57589285714285e-09 | 0.001 |
| 7.578125e-09 | 0.001 |
| 7.58035714285714e-09 | 0.001 |
| 7.58258928571428e-09 | 0.001 |
| 7.58482142857142e-09 | 0.001 |
| 7.58705357142857e-09 | 0.001 |
| 7.58928571428571e-09 | 0.001 |
| 7.59151785714285e-09 | 0.001 |
| 7.59374999999999e-09 | 0.001 |
| 7.59598214285714e-09 | 0.001 |
| 7.59821428571428e-09 | 0.001 |
| 7.60044642857142e-09 | 0.001 |
| 7.60267857142857e-09 | 0.001 |
| 7.60491071428571e-09 | 0.001 |
| 7.60714285714285e-09 | 0 |
| 7.60937499999999e-09 | 0 |
| 7.61160714285714e-09 | 0 |
| 7.61383928571428e-09 | 0 |
| 7.61607142857142e-09 | 0 |
| 7.61830357142857e-09 | 0 |
| 7.62053571428571e-09 | 0 |
| 7.62276785714285e-09 | 0 |
| 7.625e-09 | 0 |
| 7.62723214285714e-09 | 0 |
| 7.62946428571428e-09 | 0 |
| 7.63169642857142e-09 | 0 |
| 7.63392857142857e-09 | 0 |
| 7.63616071428571e-09 | 0 |
| 7.63839285714285e-09 | 0 |
| 7.640625e-09 | 0 |
| 7.64285714285714e-09 | 0.001 |
| 7.64508928571428e-09 | 0.001 |
| 7.64732142857142e-09 | 0.001 |
| 7.64955357142857e-09 | 0.001 |
| 7.65178571428571e-09 | 0.001 |
| 7.65401785714285e-09 | 0.001 |
| 7.65624999999999e-09 | 0.001 |
| 7.65848214285714e-09 | 0.001 |
| 7.66071428571428e-09 | 0.001 |
| 7.66294642857142e-09 | 0.001 |
| 7.66517857142857e-09 | 0.001 |
| 7.66741071428571e-09 | 0.001 |
| 7.66964285714285e-09 | 0.001 |
| 7.671875e-09 | 0.001 |
| 7.67410714285714e-09 | 0.001 |
| 7.67633928571428e-09 | 0.001 |
| 7.67857142857142e-09 | 0 |
| 7.68080357142857e-09 | 0 |
| 7.68303571428571e-09 | 0 |
| 7.68526785714285e-09 | 0 |
| 7.6875e-09 | 0 |
| 7.68973214285714e-09 | 0 |
| 7.69196428571428e-09 | 0 |
| 7.69419642857142e-09 | 0 |
| 7.69642857142857e-09 | 0 |
| 7.69866071428571e-09 | 0 |
| 7.70089285714285e-09 | 0 |
| 7.70312499999999e-09 | 0 |
| 7.70535714285714e-09 | 0 |
| 7.70758928571428e-09 | 0 |
| 7.70982142857142e-09 | 0 |
| 7.71205357142857e-09 | 0 |
| 7.71428571428571e-09 | 0 |
| 7.71651785714285e-09 | 0 |
| 7.71874999999999e-09 | 0 |
| 7.72098214285714e-09 | 0 |
| 7.72321428571428e-09 | 0 |
| 7.72544642857142e-09 | 0 |
| 7.72767857142857e-09 | 0 |
| 7.72991071428571e-09 | 0 |
| 7.73214285714285e-09 | 0 |
| 7.734375e-09 | 0 |
| 7.73660714285714e-09 | 0 |
| 7.73883928571428e-09 | 0 |
| 7.74107142857142e-09 | 0 |
| 7.74330357142857e-09 | 0 |
| 7.74553571428571e-09 | 0 |
| 7.74776785714285e-09 | 0 |
| 7.74999999999999e-09 | 0.001 |
| 7.75223214285714e-09 | 0.001 |
| 7.75446428571428e-09 | 0.001 |
| 7.75669642857142e-09 | 0.001 |
| 7.75892857142857e-09 | 0.001 |
| 7.76116071428571e-09 | 0.001 |
| 7.76339285714285e-09 | 0.001 |
| 7.76562499999999e-09 | 0.001 |
| 7.76785714285714e-09 | 0.001 |
| 7.77008928571428e-09 | 0.001 |
| 7.77232142857142e-09 | 0.001 |
| 7.77455357142857e-09 | 0.001 |
| 7.77678571428571e-09 | 0.001 |
| 7.77901785714285e-09 | 0.001 |
| 7.78125e-09 | 0.001 |
| 7.78348214285714e-09 | 0.001 |
| 7.78571428571428e-09 | 0 |
| 7.78794642857142e-09 | 0 |
| 7.79017857142857e-09 | 0 |
| 7.79241071428571e-09 | 0 |
| 7.79464285714285e-09 | 0 |
| 7.796875e-09 | 0 |
| 7.79910714285714e-09 | 0 |
| 7.80133928571428e-09 | 0 |
| 7.80357142857142e-09 | 0 |
| 7.80580357142857e-09 | 0 |
| 7.80803571428571e-09 | 0 |
| 7.81026785714285e-09 | 0 |
| 7.81249999999999e-09 | 0 |
| 7.81473214285714e-09 | 0 |
| 7.81696428571428e-09 | 0 |
| 7.81919642857142e-09 | 0 |
| 7.82142857142857e-09 | 0 |
| 7.82366071428571e-09 | 0 |
| 7.82589285714285e-09 | 0 |
| 7.82812499999999e-09 | 0 |
| 7.83035714285714e-09 | 0 |
| 7.83258928571428e-09 | 0 |
| 7.83482142857142e-09 | 0 |
| 7.83705357142857e-09 | 0 |
| 7.83928571428571e-09 | 0 |
| 7.84151785714285e-09 | 0 |
| 7.84375e-09 | 0 |
| 7.84598214285714e-09 | 0 |
| 7.84821428571428e-09 | 0 |
| 7.85044642857142e-09 | 0 |
| 7.85267857142857e-09 | 0 |
| 7.85491071428571e-09 | 0 |
| 7.85714285714285e-09 | 0 |
| 7.85937499999999e-09 | 0 |
| 7.86160714285714e-09 | 0 |
| 7.86383928571428e-09 | 0 |
| 7.86607142857142e-09 | 0 |
| 7.86830357142857e-09 | 0 |
| 7.87053571428571e-09 | 0 |
| 7.87276785714285e-09 | 0 |
| 7.87499999999999e-09 | 0 |
| 7.87723214285714e-09 | 0 |
| 7.87946428571428e-09 | 0 |
| 7.88169642857142e-09 | 0 |
| 7.88392857142857e-09 | 0 |
| 7.88616071428571e-09 | 0 |
| 7.88839285714285e-09 | 0 |
| 7.890625e-09 | 0 |
| 7.89285714285714e-09 | 0.001 |
| 7.89508928571428e-09 | 0.001 |
| 7.89732142857142e-09 | 0.001 |
| 7.89955357142857e-09 | 0.001 |
| 7.90178571428571e-09 | 0.001 |
| 7.90401785714285e-09 | 0.001 |
| 7.90625e-09 | 0.001 |
| 7.90848214285714e-09 | 0.001 |
| 7.91071428571428e-09 | 0.001 |
| 7.91294642857142e-09 | 0.001 |
| 7.91517857142857e-09 | 0.001 |
| 7.91741071428571e-09 | 0.001 |
| 7.91964285714285e-09 | 0.001 |
| 7.92187499999999e-09 | 0.001 |
| 7.92410714285714e-09 | 0.001 |
| 7.92633928571428e-09 | 0.001 |
| 7.92857142857142e-09 | 0 |
| 7.93080357142857e-09 | 0 |
| 7.93303571428571e-09 | 0 |
| 7.93526785714285e-09 | 0 |
| 7.93749999999999e-09 | 0 |
| 7.93973214285714e-09 | 0 |
| 7.94196428571428e-09 | 0 |
| 7.94419642857142e-09 | 0 |
| 7.94642857142857e-09 | 0 |
| 7.94866071428571e-09 | 0 |
| 7.95089285714285e-09 | 0 |
| 7.953125e-09 | 0 |
| 7.95535714285714e-09 | 0 |
| 7.95758928571428e-09 | 0 |
| 7.95982142857142e-09 | 0 |
| 7.96205357142857e-09 | 0 |
| 7.96428571428571e-09 | 0.001 |
| 7.96651785714285e-09 | 0.001 |
| 7.96874999999999e-09 | 0.001 |
| 7.97098214285714e-09 | 0.001 |
| 7.97321428571428e-09 | 0.001 |
| 7.97544642857142e-09 | 0.001 |
| 7.97767857142857e-09 | 0.001 |
| 7.97991071428571e-09 | 0.001 |
| 7.98214285714285e-09 | 0.001 |
| 7.98437499999999e-09 | 0.001 |
| 7.98660714285714e-09 | 0.001 |
| 7.98883928571428e-09 | 0.001 |
| 7.99107142857142e-09 | 0.001 |
| 7.99330357142857e-09 | 0.001 |
| 7.99553571428571e-09 | 0.001 |
| 7.99776785714285e-09 | 0.001 |
| 8e-09 | 0.001 |
| 8.00223214285714e-09 | 0.001 |
| 8.00446428571428e-09 | 0.001 |
| 8.00669642857142e-09 | 0.001 |
| 8.00892857142857e-09 | 0.001 |
| 8.01116071428571e-09 | 0.001 |
| 8.01339285714285e-09 | 0.001 |
| 8.015625e-09 | 0.001 |
| 8.01785714285714e-09 | 0.001 |
| 8.02008928571428e-09 | 0.001 |
| 8.02232142857142e-09 | 0.001 |
| 8.02455357142857e-09 | 0.001 |
| 8.02678571428571e-09 | 0.001 |
| 8.02901785714285e-09 | 0.001 |
| 8.03124999999999e-09 | 0.001 |
| 8.03348214285714e-09 | 0.001 |
| 8.03571428571428e-09 | 0.001 |
| 8.03794642857142e-09 | 0.001 |
| 8.04017857142857e-09 | 0.001 |
| 8.04241071428571e-09 | 0.001 |
| 8.04464285714285e-09 | 0.001 |
| 8.04687499999999e-09 | 0.001 |
| 8.04910714285714e-09 | 0.001 |
| 8.05133928571428e-09 | 0.001 |
| 8.05357142857142e-09 | 0.001 |
| 8.05580357142857e-09 | 0.001 |
| 8.05803571428571e-09 | 0.001 |
| 8.06026785714285e-09 | 0.001 |
| 8.0625e-09 | 0.001 |
| 8.06473214285714e-09 | 0.001 |
| 8.06696428571428e-09 | 0.001 |
| 8.06919642857142e-09 | 0.001 |
| 8.07142857142857e-09 | 0.001 |
| 8.07366071428571e-09 | 0.001 |
| 8.07589285714285e-09 | 0.001 |
| 8.07812499999999e-09 | 0.001 |
| 8.08035714285714e-09 | 0.001 |
| 8.08258928571428e-09 | 0.001 |
| 8.08482142857142e-09 | 0.001 |
| 8.08705357142857e-09 | 0.001 |
| 8.08928571428571e-09 | 0.001 |
| 8.09151785714285e-09 | 0.001 |
| 8.09374999999999e-09 | 0.001 |
| 8.09598214285714e-09 | 0.001 |
| 8.09821428571428e-09 | 0.001 |
| 8.10044642857142e-09 | 0.001 |
| 8.10267857142857e-09 | 0.001 |
| 8.10491071428571e-09 | 0.001 |
| 8.10714285714285e-09 | 0 |
| 8.109375e-09 | 0 |
| 8.11160714285714e-09 | 0 |
| 8.11383928571428e-09 | 0 |
| 8.11607142857142e-09 | 0 |
| 8.11830357142857e-09 | 0 |
| 8.12053571428571e-09 | 0 |
| 8.12276785714285e-09 | 0 |
| 8.125e-09 | 0 |
| 8.12723214285714e-09 | 0 |
| 8.12946428571428e-09 | 0 |
| 8.13169642857142e-09 | 0 |
| 8.13392857142857e-09 | 0 |
| 8.13616071428571e-09 | 0 |
| 8.13839285714285e-09 | 0 |
| 8.14062499999999e-09 | 0 |
| 8.14285714285714e-09 | 0 |
| 8.14508928571428e-09 | 0 |
| 8.14732142857142e-09 | 0 |
| 8.14955357142857e-09 | 0 |
| 8.15178571428571e-09 | 0 |
| 8.15401785714285e-09 | 0 |
| 8.15625e-09 | 0 |
| 8.15848214285714e-09 | 0 |
| 8.16071428571428e-09 | 0 |
| 8.16294642857142e-09 | 0 |
| 8.16517857142857e-09 | 0 |
| 8.16741071428571e-09 | 0 |
| 8.16964285714285e-09 | 0 |
| 8.171875e-09 | 0 |
| 8.17410714285714e-09 | 0 |
| 8.17633928571428e-09 | 0 |
| 8.17857142857142e-09 | 0.001 |
| 8.18080357142857e-09 | 0.001 |
| 8.18303571428571e-09 | 0.001 |
| 8.18526785714285e-09 | 0.001 |
| 8.18749999999999e-09 | 0.001 |
| 8.18973214285714e-09 | 0.001 |
| 8.19196428571428e-09 | 0.001 |
| 8.19419642857142e-09 | 0.001 |
| 8.19642857142857e-09 | 0.001 |
| 8.19866071428571e-09 | 0.001 |
| 8.20089285714285e-09 | 0.001 |
| 8.20312499999999e-09 | 0.001 |
| 8.20535714285714e-09 | 0.001 |
| 8.20758928571428e-09 | 0.001 |
| 8.20982142857142e-09 | 0.001 |
| 8.21205357142857e-09 | 0.001 |
| 8.21428571428571e-09 | 0 |
| 8.21651785714285e-09 | 0 |
| 8.21875e-09 | 0 |
| 8.22098214285714e-09 | 0 |
| 8.22321428571428e-09 | 0 |
| 8.22544642857142e-09 | 0 |
| 8.22767857142857e-09 | 0 |
| 8.22991071428571e-09 | 0 |
| 8.23214285714285e-09 | 0 |
| 8.23437499999999e-09 | 0 |
| 8.23660714285714e-09 | 0 |
| 8.23883928571428e-09 | 0 |
| 8.24107142857142e-09 | 0 |
| 8.24330357142857e-09 | 0 |
| 8.24553571428571e-09 | 0 |
| 8.24776785714285e-09 | 0 |
| 8.24999999999999e-09 | 0.001 |
| 8.25223214285714e-09 | 0.001 |
| 8.25446428571428e-09 | 0.001 |
| 8.25669642857142e-09 | 0.001 |
| 8.25892857142857e-09 | 0.001 |
| 8.26116071428571e-09 | 0.001 |
| 8.26339285714285e-09 | 0.001 |
| 8.265625e-09 | 0.001 |
| 8.26785714285714e-09 | 0.001 |
| 8.27008928571428e-09 | 0.001 |
| 8.27232142857142e-09 | 0.001 |
| 8.27455357142857e-09 | 0.001 |
| 8.27678571428571e-09 | 0.001 |
| 8.27901785714285e-09 | 0.001 |
| 8.28125e-09 | 0.001 |
| 8.28348214285714e-09 | 0.001 |
| 8.28571428571428e-09 | 0 |
| 8.28794642857142e-09 | 0 |
| 8.29017857142857e-09 | 0 |
| 8.29241071428571e-09 | 0 |
| 8.29464285714285e-09 | 0 |
| 8.29687499999999e-09 | 0 |
| 8.29910714285714e-09 | 0 |
| 8.30133928571428e-09 | 0 |
| 8.30357142857142e-09 | 0 |
| 8.30580357142857e-09 | 0 |
| 8.30803571428571e-09 | 0 |
| 8.31026785714285e-09 | 0 |
| 8.31249999999999e-09 | 0 |
| 8.31473214285714e-09 | 0 |
| 8.31696428571428e-09 | 0 |
| 8.31919642857142e-09 | 0 |
| 8.32142857142857e-09 | 0.001 |
| 8.32366071428571e-09 | 0.001 |
| 8.32589285714285e-09 | 0.001 |
| 8.328125e-09 | 0.001 |
| 8.33035714285714e-09 | 0.001 |
| 8.33258928571428e-09 | 0.001 |
| 8.33482142857142e-09 | 0.001 |
| 8.33705357142857e-09 | 0.001 |
| 8.33928571428571e-09 | 0.001 |
| 8.34151785714285e-09 | 0.001 |
| 8.34374999999999e-09 | 0.001 |
| 8.34598214285714e-09 | 0.001 |
| 8.34821428571428e-09 | 0.001 |
| 8.35044642857142e-09 | 0.001 |
| 8.35267857142857e-09 | 0.001 |
| 8.35491071428571e-09 | 0.001 |
| 8.35714285714285e-09 | 0 |
| 8.35937499999999e-09 | 0 |
| 8.36160714285714e-09 | 0 |
| 8.36383928571428e-09 | 0 |
| 8.36607142857142e-09 | 0 |
| 8.36830357142857e-09 | 0 |
| 8.37053571428571e-09 | 0 |
| 8.37276785714285e-09 | 0 |
| 8.375e-09 | 0 |
| 8.37723214285714e-09 | 0 |
| 8.37946428571428e-09 | 0 |
| 8.38169642857142e-09 | 0 |
| 8.38392857142857e-09 | 0 |
| 8.38616071428571e-09 | 0 |
| 8.38839285714285e-09 | 0 |
| 8.390625e-09 | 0 |
| 8.39285714285714e-09 | 0 |
| 8.39508928571428e-09 | 0 |
| 8.39732142857142e-09 | 0 |
| 8.39955357142857e-09 | 0 |
| 8.40178571428571e-09 | 0 |
| 8.40401785714285e-09 | 0 |
| 8.40624999999999e-09 | 0 |
| 8.40848214285714e-09 | 0 |
| 8.41071428571428e-09 | 0 |
| 8.41294642857142e-09 | 0 |
| 8.41517857142857e-09 | 0 |
| 8.41741071428571e-09 | 0 |
| 8.41964285714285e-09 | 0 |
| 8.42187499999999e-09 | 0 |
| 8.42410714285714e-09 | 0 |
| 8.42633928571428e-09 | 0 |
| 8.42857142857142e-09 | 0.001 |
| 8.43080357142857e-09 | 0.001 |
| 8.43303571428571e-09 | 0.001 |
| 8.43526785714285e-09 | 0.001 |
| 8.4375e-09 | 0.001 |
| 8.43973214285714e-09 | 0.001 |
| 8.44196428571428e-09 | 0.001 |
| 8.44419642857142e-09 | 0.001 |
| 8.44642857142857e-09 | 0.001 |
| 8.44866071428571e-09 | 0.001 |
| 8.45089285714285e-09 | 0.001 |
| 8.45312499999999e-09 | 0.001 |
| 8.45535714285714e-09 | 0.001 |
| 8.45758928571428e-09 | 0.001 |
| 8.45982142857142e-09 | 0.001 |
| 8.46205357142857e-09 | 0.001 |
| 8.46428571428571e-09 | 0.001 |
| 8.46651785714285e-09 | 0.001 |
| 8.46874999999999e-09 | 0.001 |
| 8.47098214285714e-09 | 0.001 |
| 8.47321428571428e-09 | 0.001 |
| 8.47544642857142e-09 | 0.001 |
| 8.47767857142857e-09 | 0.001 |
| 8.47991071428571e-09 | 0.001 |
| 8.48214285714285e-09 | 0.001 |
| 8.484375e-09 | 0.001 |
| 8.48660714285714e-09 | 0.001 |
| 8.48883928571428e-09 | 0.001 |
| 8.49107142857142e-09 | 0.001 |
| 8.49330357142857e-09 | 0.001 |
| 8.49553571428571e-09 | 0.001 |
| 8.49776785714285e-09 | 0.001 |
| 8.5e-09 | 0 |
| 8.50223214285714e-09 | 0 |
| 8.50446428571428e-09 | 0 |
| 8.50669642857142e-09 | 0 |
| 8.50892857142857e-09 | 0 |
| 8.51116071428571e-09 | 0 |
| 8.51339285714285e-09 | 0 |
| 8.51562499999999e-09 | 0 |
| 8.51785714285714e-09 | 0 |
| 8.52008928571428e-09 | 0 |
| 8.52232142857142e-09 | 0 |
| 8.52455357142857e-09 | 0 |
| 8.52678571428571e-09 | 0 |
| 8.52901785714285e-09 | 0 |
| 8.53124999999999e-09 | 0 |
| 8.53348214285714e-09 | 0 |
| 8.53571428571428e-09 | 0 |
| 8.53794642857142e-09 | 0 |
| 8.54017857142857e-09 | 0 |
| 8.54241071428571e-09 | 0 |
| 8.54464285714285e-09 | 0 |
| 8.546875e-09 | 0 |
| 8.54910714285714e-09 | 0 |
| 8.55133928571428e-09 | 0 |
| 8.55357142857142e-09 | 0 |
| 8.55580357142857e-09 | 0 |
| 8.55803571428571e-09 | 0 |
| 8.56026785714285e-09 | 0 |
| 8.56249999999999e-09 | 0 |
| 8.56473214285714e-09 | 0 |
| 8.56696428571428e-09 | 0 |
| 8.56919642857142e-09 | 0 |
| 8.57142857142857e-09 | 0 |
| 8.57366071428571e-09 | 0 |
| 8.57589285714285e-09 | 0 |
| 8.57812499999999e-09 | 0 |
| 8.58035714285714e-09 | 0 |
| 8.58258928571428e-09 | 0 |
| 8.58482142857142e-09 | 0 |
| 8.58705357142857e-09 | 0 |
| 8.58928571428571e-09 | 0 |
| 8.59151785714285e-09 | 0 |
| 8.59375e-09 | 0 |
| 8.59598214285714e-09 | 0 |
| 8.59821428571428e-09 | 0 |
| 8.60044642857142e-09 | 0 |
| 8.60267857142857e-09 | 0 |
| 8.60491071428571e-09 | 0 |
| 8.60714285714285e-09 | 0 |
| 8.609375e-09 | 0 |
| 8.61160714285714e-09 | 0 |
| 8.61383928571428e-09 | 0 |
| 8.61607142857142e-09 | 0 |
| 8.61830357142857e-09 | 0 |
| 8.62053571428571e-09 | 0 |
| 8.62276785714285e-09 | 0 |
| 8.62499999999999e-09 | 0 |
| 8.62723214285714e-09 | 0 |
| 8.62946428571428e-09 | 0 |
| 8.63169642857142e-09 | 0 |
| 8.63392857142857e-09 | 0 |
| 8.63616071428571e-09 | 0 |
| 8.63839285714285e-09 | 0 |
| 8.640625e-09 | 0 |
| 8.64285714285714e-09 | 0.001 |
| 8.64508928571428e-09 | 0.001 |
| 8.64732142857142e-09 | 0.001 |
| 8.64955357142857e-09 | 0.001 |
| 8.65178571428571e-09 | 0.001 |
| 8.65401785714285e-09 | 0.001 |
| 8.65625e-09 | 0.001 |
| 8.65848214285714e-09 | 0.001 |
| 8.66071428571428e-09 | 0.001 |
| 8.66294642857142e-09 | 0.001 |
| 8.66517857142857e-09 | 0.001 |
| 8.66741071428571e-09 | 0.001 |
| 8.66964285714285e-09 | 0.001 |
| 8.67187499999999e-09 | 0.001 |
| 8.67410714285714e-09 | 0.001 |
| 8.67633928571428e-09 | 0.001 |
| 8.67857142857142e-09 | 0.001 |
| 8.68080357142857e-09 | 0.001 |
| 8.68303571428571e-09 | 0.001 |
| 8.68526785714285e-09 | 0.001 |
| 8.68749999999999e-09 | 0.001 |
| 8.68973214285714e-09 | 0.001 |
| 8.69196428571428e-09 | 0.001 |
| 8.69419642857142e-09 | 0.001 |
| 8.69642857142857e-09 | 0.001 |
| 8.69866071428571e-09 | 0.001 |
| 8.70089285714285e-09 | 0.001 |
| 8.703125e-09 | 0.001 |
| 8.70535714285714e-09 | 0.001 |
| 8.70758928571428e-09 | 0.001 |
| 8.70982142857142e-09 | 0.001 |
| 8.71205357142857e-09 | 0.001 |
| 8.71428571428571e-09 | 0 |
| 8.71651785714285e-09 | 0 |
| 8.71874999999999e-09 | 0 |
| 8.72098214285714e-09 | 0 |
| 8.72321428571428e-09 | 0 |
| 8.72544642857142e-09 | 0 |
| 8.72767857142857e-09 | 0 |
| 8.72991071428571e-09 | 0 |
| 8.73214285714285e-09 | 0 |
| 8.73437499999999e-09 | 0 |
| 8.73660714285714e-09 | 0 |
| 8.73883928571428e-09 | 0 |
| 8.74107142857142e-09 | 0 |
| 8.74330357142857e-09 | 0 |
| 8.74553571428571e-09 | 0 |
| 8.74776785714285e-09 | 0 |
| 8.75e-09 | 0.001 |
| 8.75223214285714e-09 | 0.001 |
| 8.75446428571428e-09 | 0.001 |
| 8.75669642857142e-09 | 0.001 |
| 8.75892857142857e-09 | 0.001 |
| 8.76116071428571e-09 | 0.001 |
| 8.76339285714285e-09 | 0.001 |
| 8.765625e-09 | 0.001 |
| 8.76785714285714e-09 | 0.001 |
| 8.77008928571428e-09 | 0.001 |
| 8.77232142857142e-09 | 0.001 |
| 8.77455357142857e-09 | 0.001 |
| 8.77678571428571e-09 | 0.001 |
| 8.77901785714285e-09 | 0.001 |
| 8.78124999999999e-09 | 0.001 |
| 8.78348214285714e-09 | 0.001 |
| 8.78571428571428e-09 | 0 |
| 8.78794642857142e-09 | 0 |
| 8.79017857142857e-09 | 0 |
| 8.79241071428571e-09 | 0 |
| 8.79464285714285e-09 | 0 |
| 8.79687499999999e-09 | 0 |
| 8.79910714285714e-09 | 0 |
| 8.80133928571428e-09 | 0 |
| 8.80357142857142e-09 | 0 |
| 8.80580357142857e-09 | 0 |
| 8.80803571428571e-09 | 0 |
| 8.81026785714285e-09 | 0 |
| 8.8125e-09 | 0 |
| 8.81473214285714e-09 | 0 |
| 8.81696428571428e-09 | 0 |
| 8.81919642857142e-09 | 0 |
| 8.82142857142857e-09 | 0 |
| 8.82366071428571e-09 | 0 |
| 8.82589285714285e-09 | 0 |
| 8.82812499999999e-09 | 0 |
| 8.83035714285714e-09 | 0 |
| 8.83258928571428e-09 | 0 |
| 8.83482142857142e-09 | 0 |
| 8.83705357142857e-09 | 0 |
| 8.83928571428571e-09 | 0 |
| 8.84151785714285e-09 | 0 |
| 8.84374999999999e-09 | 0 |
| 8.84598214285714e-09 | 0 |
| 8.84821428571428e-09 | 0 |
| 8.85044642857142e-09 | 0 |
| 8.85267857142857e-09 | 0 |
| 8.85491071428571e-09 | 0 |
| 8.85714285714285e-09 | 0.001 |
| 8.859375e-09 | 0.001 |
| 8.86160714285714e-09 | 0.001 |
| 8.86383928571428e-09 | 0.001 |
| 8.86607142857142e-09 | 0.001 |
| 8.86830357142857e-09 | 0.001 |
| 8.87053571428571e-09 | 0.001 |
| 8.87276785714285e-09 | 0.001 |
| 8.875e-09 | 0.001 |
| 8.87723214285714e-09 | 0.001 |
| 8.87946428571428e-09 | 0.001 |
| 8.88169642857142e-09 | 0.001 |
| 8.88392857142857e-09 | 0.001 |
| 8.88616071428571e-09 | 0.001 |
| 8.88839285714285e-09 | 0.001 |
| 8.89062499999999e-09 | 0.001 |
| 8.89285714285714e-09 | 0 |
| 8.89508928571428e-09 | 0 |
| 8.89732142857142e-09 | 0 |
| 8.89955357142857e-09 | 0 |
| 8.90178571428571e-09 | 0 |
| 8.90401785714285e-09 | 0 |
| 8.90624999999999e-09 | 0 |
| 8.90848214285714e-09 | 0 |
| 8.91071428571428e-09 | 0 |
| 8.91294642857142e-09 | 0 |
| 8.91517857142857e-09 | 0 |
| 8.91741071428571e-09 | 0 |
| 8.91964285714285e-09 | 0 |
| 8.921875e-09 | 0 |
| 8.92410714285714e-09 | 0 |
| 8.92633928571428e-09 | 0 |
| 8.92857142857142e-09 | 0 |
| 8.93080357142857e-09 | 0 |
| 8.93303571428571e-09 | 0 |
| 8.93526785714285e-09 | 0 |
| 8.93749999999999e-09 | 0 |
| 8.93973214285714e-09 | 0 |
| 8.94196428571428e-09 | 0 |
| 8.94419642857142e-09 | 0 |
| 8.94642857142857e-09 | 0 |
| 8.94866071428571e-09 | 0 |
| 8.95089285714285e-09 | 0 |
| 8.95312499999999e-09 | 0 |
| 8.95535714285714e-09 | 0 |
| 8.95758928571428e-09 | 0 |
| 8.95982142857142e-09 | 0 |
| 8.96205357142857e-09 | 0 |
| 8.96428571428571e-09 | 0.001 |
| 8.96651785714285e-09 | 0.001 |
| 8.96875e-09 | 0.001 |
| 8.97098214285714e-09 | 0.001 |
| 8.97321428571428e-09 | 0.001 |
| 8.97544642857142e-09 | 0.001 |
| 8.97767857142857e-09 | 0.001 |
| 8.97991071428571e-09 | 0.001 |
| 8.98214285714285e-09 | 0.001 |
| 8.984375e-09 | 0.001 |
| 8.98660714285714e-09 | 0.001 |
| 8.98883928571428e-09 | 0.001 |
| 8.99107142857142e-09 | 0.001 |
| 8.99330357142857e-09 | 0.001 |
| 8.99553571428571e-09 | 0.001 |
| 8.99776785714285e-09 | 0.001 |
| 8.99999999999999e-09 | 0.001 |
| 9.00223214285714e-09 | 0.001 |
| 9.00446428571428e-09 | 0.001 |
| 9.00669642857142e-09 | 0.001 |
| 9.00892857142857e-09 | 0.001 |
| 9.01116071428571e-09 | 0.001 |
| 9.01339285714285e-09 | 0.001 |
| 9.01562499999999e-09 | 0.001 |
| 9.01785714285714e-09 | 0.001 |
| 9.02008928571428e-09 | 0.001 |
| 9.02232142857142e-09 | 0.001 |
| 9.02455357142857e-09 | 0.001 |
| 9.02678571428571e-09 | 0.001 |
| 9.02901785714285e-09 | 0.001 |
| 9.03125e-09 | 0.001 |
| 9.03348214285714e-09 | 0.001 |
| 9.03571428571428e-09 | 0 |
| 9.03794642857142e-09 | 0 |
| 9.04017857142857e-09 | 0 |
| 9.04241071428571e-09 | 0 |
| 9.04464285714285e-09 | 0 |
| 9.04687499999999e-09 | 0 |
| 9.04910714285714e-09 | 0 |
| 9.05133928571428e-09 | 0 |
| 9.05357142857142e-09 | 0 |
| 9.05580357142857e-09 | 0 |
| 9.05803571428571e-09 | 0 |
| 9.06026785714285e-09 | 0 |
| 9.06249999999999e-09 | 0 |
| 9.06473214285714e-09 | 0 |
| 9.06696428571428e-09 | 0 |
| 9.06919642857142e-09 | 0 |
| 9.07142857142857e-09 | 0.001 |
| 9.07366071428571e-09 | 0.001 |
| 9.07589285714285e-09 | 0.001 |
| 9.078125e-09 | 0.001 |
| 9.08035714285714e-09 | 0.001 |
| 9.08258928571428e-09 | 0.001 |
| 9.08482142857142e-09 | 0.001 |
| 9.08705357142857e-09 | 0.001 |
| 9.08928571428571e-09 | 0.001 |
| 9.09151785714285e-09 | 0.001 |
| 9.09375e-09 | 0.001 |
| 9.09598214285714e-09 | 0.001 |
| 9.09821428571428e-09 | 0.001 |
| 9.10044642857142e-09 | 0.001 |
| 9.10267857142857e-09 | 0.001 |
| 9.10491071428571e-09 | 0.001 |
| 9.10714285714285e-09 | 0.001 |
| 9.10937499999999e-09 | 0.001 |
| 9.11160714285714e-09 | 0.001 |
| 9.11383928571428e-09 | 0.001 |
| 9.11607142857142e-09 | 0.001 |
| 9.11830357142857e-09 | 0.001 |
| 9.12053571428571e-09 | 0.001 |
| 9.12276785714285e-09 | 0.001 |
| 9.125e-09 | 0.001 |
| 9.12723214285714e-09 | 0.001 |
| 9.12946428571428e-09 | 0.001 |
| 9.13169642857142e-09 | 0.001 |
| 9.13392857142857e-09 | 0.001 |
| 9.13616071428571e-09 | 0.001 |
| 9.13839285714285e-09 | 0.001 |
| 9.140625e-09 | 0.001 |